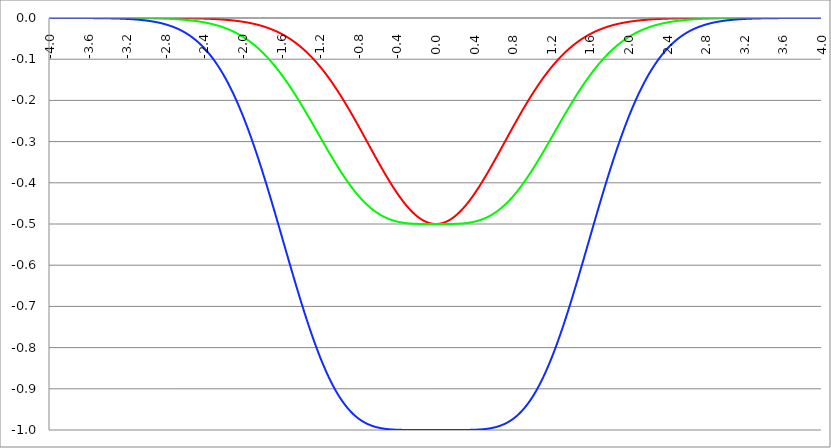
| Category | Series 1 | Series 0 | Series 2 |
|---|---|---|---|
| -4.0 | 0 | 0 | 0 |
| -3.996 | 0 | 0 | 0 |
| -3.992 | 0 | 0 | 0 |
| -3.988 | 0 | 0 | 0 |
| -3.984 | 0 | 0 | 0 |
| -3.98 | 0 | 0 | 0 |
| -3.976 | 0 | 0 | 0 |
| -3.972 | 0 | 0 | 0 |
| -3.968 | 0 | 0 | 0 |
| -3.964 | 0 | 0 | 0 |
| -3.96 | 0 | 0 | 0 |
| -3.956 | 0 | 0 | 0 |
| -3.952 | 0 | 0 | 0 |
| -3.948 | 0 | 0 | 0 |
| -3.944 | 0 | 0 | 0 |
| -3.94 | 0 | 0 | 0 |
| -3.936 | 0 | 0 | 0 |
| -3.932 | 0 | 0 | 0 |
| -3.928 | 0 | 0 | 0 |
| -3.924 | 0 | 0 | 0 |
| -3.92 | 0 | 0 | 0 |
| -3.916 | 0 | 0 | 0 |
| -3.912 | 0 | 0 | 0 |
| -3.908 | 0 | 0 | 0 |
| -3.904 | 0 | 0 | 0 |
| -3.9 | 0 | 0 | 0 |
| -3.896 | 0 | 0 | 0 |
| -3.892 | 0 | 0 | 0 |
| -3.888 | 0 | 0 | 0 |
| -3.884 | 0 | 0 | 0 |
| -3.88 | 0 | 0 | 0 |
| -3.876 | 0 | 0 | 0 |
| -3.872 | 0 | 0 | 0 |
| -3.868 | 0 | 0 | 0 |
| -3.864 | 0 | 0 | 0 |
| -3.86 | 0 | 0 | 0 |
| -3.856 | 0 | 0 | 0 |
| -3.852 | 0 | 0 | 0 |
| -3.848 | 0 | 0 | 0 |
| -3.844 | 0 | 0 | 0 |
| -3.84 | 0 | 0 | 0 |
| -3.836 | 0 | 0 | 0 |
| -3.832 | 0 | 0 | 0 |
| -3.828 | 0 | 0 | 0 |
| -3.824 | 0 | 0 | 0 |
| -3.82 | 0 | 0 | 0 |
| -3.816 | 0 | 0 | 0 |
| -3.812 | 0 | 0 | 0 |
| -3.808 | 0 | 0 | 0 |
| -3.804 | 0 | 0 | 0 |
| -3.8 | 0 | 0 | 0 |
| -3.796 | 0 | 0 | 0 |
| -3.792 | 0 | 0 | 0 |
| -3.788 | 0 | 0 | 0 |
| -3.784 | 0 | 0 | 0 |
| -3.78 | 0 | 0 | 0 |
| -3.776 | 0 | 0 | 0 |
| -3.772 | 0 | 0 | 0 |
| -3.768 | 0 | 0 | 0 |
| -3.764 | 0 | 0 | 0 |
| -3.76 | 0 | 0 | 0 |
| -3.756 | 0 | 0 | 0 |
| -3.752 | 0 | 0 | 0 |
| -3.748 | 0 | 0 | 0 |
| -3.744 | 0 | 0 | 0 |
| -3.74 | 0 | 0 | 0 |
| -3.736 | 0 | 0 | 0 |
| -3.732 | 0 | 0 | 0 |
| -3.728 | 0 | 0 | 0 |
| -3.724 | 0 | 0 | 0 |
| -3.72 | 0 | 0 | 0 |
| -3.716 | 0 | 0 | 0 |
| -3.712 | 0 | 0 | 0 |
| -3.708 | 0 | 0 | 0 |
| -3.704 | 0 | 0 | 0 |
| -3.7 | 0 | 0 | 0 |
| -3.696 | 0 | 0 | 0 |
| -3.692 | 0 | 0 | 0 |
| -3.688 | 0 | 0 | 0 |
| -3.684 | 0 | 0 | 0 |
| -3.68 | 0 | 0 | 0 |
| -3.676 | 0 | 0 | 0 |
| -3.672 | 0 | 0 | 0 |
| -3.668 | 0 | 0 | 0 |
| -3.664 | 0 | 0 | 0 |
| -3.66 | 0 | 0 | 0 |
| -3.656 | 0 | 0 | 0 |
| -3.652 | 0 | 0 | 0 |
| -3.648 | 0 | 0 | 0 |
| -3.644 | 0 | 0 | 0 |
| -3.64 | 0 | 0 | 0 |
| -3.636 | 0 | 0 | 0 |
| -3.632 | 0 | 0 | 0 |
| -3.628 | 0 | 0 | 0 |
| -3.624 | 0 | 0 | 0 |
| -3.62 | 0 | 0 | 0 |
| -3.616 | 0 | 0 | 0 |
| -3.612 | 0 | 0 | 0 |
| -3.608 | 0 | 0 | 0 |
| -3.604 | 0 | 0 | 0 |
| -3.6 | 0 | 0 | 0 |
| -3.596 | 0 | 0 | 0 |
| -3.592 | 0 | 0 | 0 |
| -3.588 | 0 | 0 | 0 |
| -3.584 | 0 | 0 | 0 |
| -3.58 | 0 | 0 | 0 |
| -3.576 | 0 | 0 | 0 |
| -3.572 | 0 | 0 | 0 |
| -3.568 | 0 | 0 | 0 |
| -3.564 | 0 | 0 | 0 |
| -3.56 | 0 | 0 | 0 |
| -3.556 | 0 | 0 | 0 |
| -3.552 | 0 | 0 | 0 |
| -3.548 | 0 | 0 | 0 |
| -3.544 | 0 | 0 | 0 |
| -3.54 | 0 | 0 | 0 |
| -3.536 | 0 | 0 | 0 |
| -3.532 | 0 | 0 | 0 |
| -3.528 | 0 | 0 | 0 |
| -3.524 | 0 | 0 | 0 |
| -3.52 | 0 | 0 | 0 |
| -3.516 | 0 | 0 | 0 |
| -3.512 | 0 | 0 | 0 |
| -3.508 | 0 | 0 | 0 |
| -3.504 | 0 | 0 | 0 |
| -3.5 | 0 | 0 | 0 |
| -3.496 | 0 | 0 | 0 |
| -3.492 | 0 | 0 | 0 |
| -3.488 | 0 | 0 | 0 |
| -3.484 | 0 | 0 | 0 |
| -3.48 | 0 | 0 | 0 |
| -3.476 | 0 | 0 | 0 |
| -3.472 | 0 | 0 | 0 |
| -3.467999999999999 | 0 | 0 | -0.001 |
| -3.463999999999999 | 0 | 0 | -0.001 |
| -3.459999999999999 | 0 | 0 | -0.001 |
| -3.455999999999999 | 0 | 0 | -0.001 |
| -3.451999999999999 | 0 | 0 | -0.001 |
| -3.447999999999999 | 0 | 0 | -0.001 |
| -3.443999999999999 | 0 | 0 | -0.001 |
| -3.439999999999999 | 0 | 0 | -0.001 |
| -3.435999999999999 | 0 | 0 | -0.001 |
| -3.431999999999999 | 0 | 0 | -0.001 |
| -3.427999999999999 | 0 | 0 | -0.001 |
| -3.423999999999999 | 0 | 0 | -0.001 |
| -3.419999999999999 | 0 | 0 | -0.001 |
| -3.415999999999999 | 0 | 0 | -0.001 |
| -3.411999999999999 | 0 | 0 | -0.001 |
| -3.407999999999999 | 0 | 0 | -0.001 |
| -3.403999999999999 | 0 | 0 | -0.001 |
| -3.399999999999999 | 0 | 0 | -0.001 |
| -3.395999999999999 | 0 | 0 | -0.001 |
| -3.391999999999999 | 0 | 0 | -0.001 |
| -3.387999999999999 | 0 | 0 | -0.001 |
| -3.383999999999999 | 0 | 0 | -0.001 |
| -3.379999999999999 | 0 | 0 | -0.001 |
| -3.375999999999999 | 0 | 0 | -0.001 |
| -3.371999999999999 | 0 | 0 | -0.001 |
| -3.367999999999999 | 0 | 0 | -0.001 |
| -3.363999999999999 | 0 | 0 | -0.001 |
| -3.359999999999999 | 0 | 0 | -0.001 |
| -3.355999999999999 | 0 | 0 | -0.001 |
| -3.351999999999999 | 0 | 0 | -0.001 |
| -3.347999999999999 | 0 | 0 | -0.001 |
| -3.343999999999999 | 0 | 0 | -0.001 |
| -3.339999999999999 | 0 | 0 | -0.001 |
| -3.335999999999999 | 0 | 0 | -0.001 |
| -3.331999999999999 | 0 | 0 | -0.001 |
| -3.327999999999999 | 0 | 0 | -0.001 |
| -3.323999999999999 | 0 | 0 | -0.001 |
| -3.319999999999999 | 0 | 0 | -0.001 |
| -3.315999999999999 | 0 | 0 | -0.001 |
| -3.311999999999999 | 0 | 0 | -0.001 |
| -3.307999999999999 | 0 | 0 | -0.001 |
| -3.303999999999999 | 0 | 0 | -0.001 |
| -3.299999999999999 | 0 | 0 | -0.001 |
| -3.295999999999999 | 0 | 0 | -0.001 |
| -3.291999999999999 | 0 | 0 | -0.001 |
| -3.288 | 0 | 0 | -0.001 |
| -3.284 | 0 | 0 | -0.001 |
| -3.279999999999999 | 0 | 0 | -0.001 |
| -3.275999999999999 | 0 | 0 | -0.002 |
| -3.271999999999999 | 0 | 0 | -0.002 |
| -3.268 | 0 | 0 | -0.002 |
| -3.264 | 0 | 0 | -0.002 |
| -3.259999999999999 | 0 | 0 | -0.002 |
| -3.255999999999999 | 0 | 0 | -0.002 |
| -3.251999999999999 | 0 | 0 | -0.002 |
| -3.248 | 0 | 0 | -0.002 |
| -3.244 | 0 | 0 | -0.002 |
| -3.239999999999999 | 0 | 0 | -0.002 |
| -3.235999999999999 | 0 | 0 | -0.002 |
| -3.231999999999999 | 0 | 0 | -0.002 |
| -3.228 | 0 | 0 | -0.002 |
| -3.224 | 0 | 0 | -0.002 |
| -3.219999999999999 | 0 | 0 | -0.002 |
| -3.215999999999999 | 0 | 0 | -0.002 |
| -3.211999999999999 | 0 | 0 | -0.002 |
| -3.208 | 0 | 0 | -0.002 |
| -3.204 | 0 | 0 | -0.002 |
| -3.199999999999999 | 0 | 0 | -0.002 |
| -3.195999999999999 | 0 | 0 | -0.002 |
| -3.191999999999999 | 0 | 0 | -0.002 |
| -3.188 | 0 | 0 | -0.002 |
| -3.184 | 0 | 0 | -0.002 |
| -3.179999999999999 | 0 | 0 | -0.003 |
| -3.175999999999999 | 0 | 0 | -0.003 |
| -3.171999999999999 | 0 | 0 | -0.003 |
| -3.168 | 0 | 0 | -0.003 |
| -3.164 | 0 | 0 | -0.003 |
| -3.159999999999999 | 0 | 0 | -0.003 |
| -3.155999999999999 | 0 | 0 | -0.003 |
| -3.151999999999999 | 0 | 0 | -0.003 |
| -3.148 | 0 | 0 | -0.003 |
| -3.144 | 0 | 0 | -0.003 |
| -3.139999999999999 | 0 | 0 | -0.003 |
| -3.135999999999999 | 0 | 0 | -0.003 |
| -3.131999999999999 | 0 | 0 | -0.003 |
| -3.128 | 0 | 0 | -0.003 |
| -3.124 | 0 | 0 | -0.003 |
| -3.119999999999999 | 0 | 0 | -0.003 |
| -3.115999999999999 | 0 | 0 | -0.004 |
| -3.111999999999999 | 0 | 0 | -0.004 |
| -3.108 | 0 | 0 | -0.004 |
| -3.104 | 0 | 0 | -0.004 |
| -3.099999999999999 | 0 | 0 | -0.004 |
| -3.095999999999999 | 0 | 0 | -0.004 |
| -3.091999999999999 | 0 | 0 | -0.004 |
| -3.088 | 0 | 0 | -0.004 |
| -3.084 | 0 | 0 | -0.004 |
| -3.079999999999999 | 0 | 0 | -0.004 |
| -3.075999999999999 | 0 | 0 | -0.004 |
| -3.071999999999999 | 0 | 0 | -0.004 |
| -3.068 | 0 | 0 | -0.004 |
| -3.064 | 0 | 0 | -0.005 |
| -3.059999999999999 | 0 | 0 | -0.005 |
| -3.055999999999999 | 0 | 0 | -0.005 |
| -3.051999999999999 | 0 | 0 | -0.005 |
| -3.048 | 0 | 0 | -0.005 |
| -3.044 | 0 | 0 | -0.005 |
| -3.039999999999999 | 0 | 0 | -0.005 |
| -3.035999999999999 | 0 | -0.001 | -0.005 |
| -3.031999999999999 | 0 | -0.001 | -0.005 |
| -3.028 | 0 | -0.001 | -0.005 |
| -3.024 | 0 | -0.001 | -0.006 |
| -3.019999999999999 | 0 | -0.001 | -0.006 |
| -3.015999999999999 | 0 | -0.001 | -0.006 |
| -3.011999999999999 | 0 | -0.001 | -0.006 |
| -3.008 | 0 | -0.001 | -0.006 |
| -3.004 | 0 | -0.001 | -0.006 |
| -2.999999999999999 | 0 | -0.001 | -0.006 |
| -2.995999999999999 | 0 | -0.001 | -0.006 |
| -2.991999999999999 | 0 | -0.001 | -0.006 |
| -2.988 | 0 | -0.001 | -0.007 |
| -2.984 | 0 | -0.001 | -0.007 |
| -2.979999999999999 | 0 | -0.001 | -0.007 |
| -2.975999999999999 | 0 | -0.001 | -0.007 |
| -2.971999999999999 | 0 | -0.001 | -0.007 |
| -2.968 | 0 | -0.001 | -0.007 |
| -2.964 | 0 | -0.001 | -0.007 |
| -2.959999999999999 | 0 | -0.001 | -0.008 |
| -2.955999999999999 | 0 | -0.001 | -0.008 |
| -2.951999999999999 | 0 | -0.001 | -0.008 |
| -2.948 | 0 | -0.001 | -0.008 |
| -2.944 | 0 | -0.001 | -0.008 |
| -2.939999999999999 | 0 | -0.001 | -0.008 |
| -2.935999999999999 | 0 | -0.001 | -0.008 |
| -2.931999999999999 | 0 | -0.001 | -0.009 |
| -2.928 | 0 | -0.001 | -0.009 |
| -2.924 | 0 | -0.001 | -0.009 |
| -2.919999999999999 | 0 | -0.001 | -0.009 |
| -2.915999999999999 | 0 | -0.001 | -0.009 |
| -2.911999999999999 | 0 | -0.001 | -0.009 |
| -2.908 | 0 | -0.001 | -0.01 |
| -2.904 | 0 | -0.001 | -0.01 |
| -2.899999999999999 | 0 | -0.001 | -0.01 |
| -2.895999999999999 | 0 | -0.001 | -0.01 |
| -2.891999999999999 | 0 | -0.001 | -0.01 |
| -2.887999999999999 | 0 | -0.001 | -0.011 |
| -2.883999999999999 | 0 | -0.001 | -0.011 |
| -2.879999999999999 | 0 | -0.001 | -0.011 |
| -2.875999999999999 | 0 | -0.001 | -0.011 |
| -2.871999999999999 | 0 | -0.001 | -0.011 |
| -2.867999999999999 | 0 | -0.001 | -0.012 |
| -2.863999999999999 | 0 | -0.001 | -0.012 |
| -2.859999999999999 | 0 | -0.001 | -0.012 |
| -2.855999999999999 | 0 | -0.001 | -0.012 |
| -2.851999999999999 | 0 | -0.001 | -0.012 |
| -2.847999999999999 | 0 | -0.001 | -0.013 |
| -2.843999999999999 | 0 | -0.001 | -0.013 |
| -2.839999999999999 | 0 | -0.001 | -0.013 |
| -2.835999999999999 | 0 | -0.001 | -0.013 |
| -2.831999999999999 | 0 | -0.001 | -0.014 |
| -2.827999999999999 | 0 | -0.002 | -0.014 |
| -2.823999999999999 | 0 | -0.002 | -0.014 |
| -2.819999999999999 | 0 | -0.002 | -0.014 |
| -2.815999999999999 | 0 | -0.002 | -0.015 |
| -2.811999999999999 | 0 | -0.002 | -0.015 |
| -2.807999999999999 | 0 | -0.002 | -0.015 |
| -2.803999999999999 | 0 | -0.002 | -0.015 |
| -2.799999999999999 | 0 | -0.002 | -0.016 |
| -2.795999999999999 | 0 | -0.002 | -0.016 |
| -2.791999999999999 | 0 | -0.002 | -0.016 |
| -2.787999999999999 | 0 | -0.002 | -0.016 |
| -2.783999999999999 | 0 | -0.002 | -0.017 |
| -2.779999999999999 | 0 | -0.002 | -0.017 |
| -2.775999999999999 | 0 | -0.002 | -0.017 |
| -2.771999999999999 | 0 | -0.002 | -0.018 |
| -2.767999999999999 | 0 | -0.002 | -0.018 |
| -2.763999999999999 | 0 | -0.002 | -0.018 |
| -2.759999999999999 | 0 | -0.002 | -0.019 |
| -2.755999999999999 | 0 | -0.002 | -0.019 |
| -2.751999999999999 | 0 | -0.002 | -0.019 |
| -2.747999999999999 | 0 | -0.002 | -0.019 |
| -2.743999999999999 | 0 | -0.002 | -0.02 |
| -2.739999999999999 | 0 | -0.002 | -0.02 |
| -2.735999999999999 | 0 | -0.002 | -0.02 |
| -2.731999999999999 | 0 | -0.002 | -0.021 |
| -2.727999999999999 | 0 | -0.002 | -0.021 |
| -2.723999999999999 | 0 | -0.003 | -0.022 |
| -2.719999999999999 | 0 | -0.003 | -0.022 |
| -2.715999999999999 | 0 | -0.003 | -0.022 |
| -2.711999999999999 | 0 | -0.003 | -0.023 |
| -2.707999999999999 | 0 | -0.003 | -0.023 |
| -2.703999999999999 | 0 | -0.003 | -0.023 |
| -2.699999999999999 | 0 | -0.003 | -0.024 |
| -2.695999999999999 | 0 | -0.003 | -0.024 |
| -2.691999999999999 | 0 | -0.003 | -0.025 |
| -2.687999999999999 | 0 | -0.003 | -0.025 |
| -2.683999999999999 | 0 | -0.003 | -0.025 |
| -2.679999999999999 | 0 | -0.003 | -0.026 |
| -2.675999999999999 | 0 | -0.003 | -0.026 |
| -2.671999999999999 | 0 | -0.003 | -0.027 |
| -2.667999999999999 | 0 | -0.003 | -0.027 |
| -2.663999999999999 | 0 | -0.003 | -0.028 |
| -2.659999999999999 | 0 | -0.003 | -0.028 |
| -2.655999999999999 | 0 | -0.003 | -0.028 |
| -2.651999999999999 | 0 | -0.004 | -0.029 |
| -2.647999999999999 | 0 | -0.004 | -0.029 |
| -2.643999999999999 | 0 | -0.004 | -0.03 |
| -2.639999999999999 | 0 | -0.004 | -0.03 |
| -2.635999999999999 | 0 | -0.004 | -0.031 |
| -2.631999999999999 | 0 | -0.004 | -0.031 |
| -2.627999999999999 | -0.001 | -0.004 | -0.032 |
| -2.623999999999999 | -0.001 | -0.004 | -0.032 |
| -2.619999999999999 | -0.001 | -0.004 | -0.033 |
| -2.615999999999999 | -0.001 | -0.004 | -0.033 |
| -2.611999999999999 | -0.001 | -0.004 | -0.034 |
| -2.607999999999999 | -0.001 | -0.004 | -0.034 |
| -2.603999999999999 | -0.001 | -0.004 | -0.035 |
| -2.599999999999999 | -0.001 | -0.004 | -0.035 |
| -2.595999999999999 | -0.001 | -0.005 | -0.036 |
| -2.591999999999999 | -0.001 | -0.005 | -0.037 |
| -2.587999999999999 | -0.001 | -0.005 | -0.037 |
| -2.583999999999999 | -0.001 | -0.005 | -0.038 |
| -2.579999999999999 | -0.001 | -0.005 | -0.038 |
| -2.575999999999999 | -0.001 | -0.005 | -0.039 |
| -2.571999999999999 | -0.001 | -0.005 | -0.04 |
| -2.567999999999999 | -0.001 | -0.005 | -0.04 |
| -2.563999999999999 | -0.001 | -0.005 | -0.041 |
| -2.559999999999999 | -0.001 | -0.005 | -0.041 |
| -2.555999999999999 | -0.001 | -0.005 | -0.042 |
| -2.551999999999999 | -0.001 | -0.006 | -0.043 |
| -2.547999999999999 | -0.001 | -0.006 | -0.043 |
| -2.543999999999999 | -0.001 | -0.006 | -0.044 |
| -2.539999999999999 | -0.001 | -0.006 | -0.045 |
| -2.535999999999999 | -0.001 | -0.006 | -0.045 |
| -2.531999999999999 | -0.001 | -0.006 | -0.046 |
| -2.527999999999999 | -0.001 | -0.006 | -0.047 |
| -2.523999999999999 | -0.001 | -0.006 | -0.047 |
| -2.519999999999999 | -0.001 | -0.006 | -0.048 |
| -2.515999999999999 | -0.001 | -0.007 | -0.049 |
| -2.511999999999999 | -0.001 | -0.007 | -0.049 |
| -2.507999999999999 | -0.001 | -0.007 | -0.05 |
| -2.503999999999999 | -0.001 | -0.007 | -0.051 |
| -2.499999999999999 | -0.001 | -0.007 | -0.052 |
| -2.495999999999999 | -0.001 | -0.007 | -0.052 |
| -2.491999999999999 | -0.001 | -0.007 | -0.053 |
| -2.487999999999999 | -0.001 | -0.007 | -0.054 |
| -2.483999999999999 | -0.001 | -0.007 | -0.055 |
| -2.479999999999999 | -0.001 | -0.008 | -0.056 |
| -2.475999999999999 | -0.001 | -0.008 | -0.056 |
| -2.471999999999999 | -0.001 | -0.008 | -0.057 |
| -2.467999999999999 | -0.001 | -0.008 | -0.058 |
| -2.463999999999999 | -0.001 | -0.008 | -0.059 |
| -2.459999999999999 | -0.001 | -0.008 | -0.06 |
| -2.455999999999999 | -0.001 | -0.008 | -0.061 |
| -2.451999999999999 | -0.001 | -0.009 | -0.061 |
| -2.447999999999999 | -0.001 | -0.009 | -0.062 |
| -2.443999999999999 | -0.001 | -0.009 | -0.063 |
| -2.439999999999999 | -0.001 | -0.009 | -0.064 |
| -2.435999999999999 | -0.001 | -0.009 | -0.065 |
| -2.431999999999999 | -0.001 | -0.009 | -0.066 |
| -2.427999999999999 | -0.001 | -0.009 | -0.067 |
| -2.423999999999999 | -0.001 | -0.01 | -0.068 |
| -2.419999999999999 | -0.001 | -0.01 | -0.069 |
| -2.415999999999999 | -0.001 | -0.01 | -0.07 |
| -2.411999999999999 | -0.001 | -0.01 | -0.071 |
| -2.407999999999999 | -0.002 | -0.01 | -0.072 |
| -2.403999999999999 | -0.002 | -0.01 | -0.073 |
| -2.399999999999999 | -0.002 | -0.011 | -0.074 |
| -2.395999999999999 | -0.002 | -0.011 | -0.075 |
| -2.391999999999999 | -0.002 | -0.011 | -0.076 |
| -2.387999999999999 | -0.002 | -0.011 | -0.077 |
| -2.383999999999999 | -0.002 | -0.011 | -0.078 |
| -2.379999999999999 | -0.002 | -0.012 | -0.079 |
| -2.375999999999999 | -0.002 | -0.012 | -0.08 |
| -2.371999999999999 | -0.002 | -0.012 | -0.081 |
| -2.367999999999998 | -0.002 | -0.012 | -0.082 |
| -2.363999999999998 | -0.002 | -0.012 | -0.083 |
| -2.359999999999998 | -0.002 | -0.013 | -0.084 |
| -2.355999999999998 | -0.002 | -0.013 | -0.085 |
| -2.351999999999998 | -0.002 | -0.013 | -0.086 |
| -2.347999999999998 | -0.002 | -0.013 | -0.088 |
| -2.343999999999998 | -0.002 | -0.013 | -0.089 |
| -2.339999999999998 | -0.002 | -0.014 | -0.09 |
| -2.335999999999998 | -0.002 | -0.014 | -0.091 |
| -2.331999999999998 | -0.002 | -0.014 | -0.092 |
| -2.327999999999998 | -0.002 | -0.014 | -0.093 |
| -2.323999999999998 | -0.002 | -0.014 | -0.095 |
| -2.319999999999998 | -0.002 | -0.015 | -0.096 |
| -2.315999999999998 | -0.002 | -0.015 | -0.097 |
| -2.311999999999998 | -0.002 | -0.015 | -0.098 |
| -2.307999999999998 | -0.002 | -0.015 | -0.1 |
| -2.303999999999998 | -0.002 | -0.016 | -0.101 |
| -2.299999999999998 | -0.003 | -0.016 | -0.102 |
| -2.295999999999998 | -0.003 | -0.016 | -0.104 |
| -2.291999999999998 | -0.003 | -0.016 | -0.105 |
| -2.287999999999998 | -0.003 | -0.017 | -0.106 |
| -2.283999999999998 | -0.003 | -0.017 | -0.108 |
| -2.279999999999998 | -0.003 | -0.017 | -0.109 |
| -2.275999999999998 | -0.003 | -0.017 | -0.11 |
| -2.271999999999998 | -0.003 | -0.018 | -0.112 |
| -2.267999999999998 | -0.003 | -0.018 | -0.113 |
| -2.263999999999998 | -0.003 | -0.018 | -0.114 |
| -2.259999999999998 | -0.003 | -0.018 | -0.116 |
| -2.255999999999998 | -0.003 | -0.019 | -0.117 |
| -2.251999999999998 | -0.003 | -0.019 | -0.119 |
| -2.247999999999998 | -0.003 | -0.019 | -0.12 |
| -2.243999999999998 | -0.003 | -0.02 | -0.122 |
| -2.239999999999998 | -0.003 | -0.02 | -0.123 |
| -2.235999999999998 | -0.003 | -0.02 | -0.125 |
| -2.231999999999998 | -0.003 | -0.021 | -0.126 |
| -2.227999999999998 | -0.003 | -0.021 | -0.128 |
| -2.223999999999998 | -0.004 | -0.021 | -0.129 |
| -2.219999999999998 | -0.004 | -0.021 | -0.131 |
| -2.215999999999998 | -0.004 | -0.022 | -0.132 |
| -2.211999999999998 | -0.004 | -0.022 | -0.134 |
| -2.207999999999998 | -0.004 | -0.022 | -0.136 |
| -2.203999999999998 | -0.004 | -0.023 | -0.137 |
| -2.199999999999998 | -0.004 | -0.023 | -0.139 |
| -2.195999999999998 | -0.004 | -0.023 | -0.14 |
| -2.191999999999998 | -0.004 | -0.024 | -0.142 |
| -2.187999999999998 | -0.004 | -0.024 | -0.144 |
| -2.183999999999998 | -0.004 | -0.024 | -0.145 |
| -2.179999999999998 | -0.004 | -0.025 | -0.147 |
| -2.175999999999998 | -0.004 | -0.025 | -0.149 |
| -2.171999999999998 | -0.004 | -0.026 | -0.151 |
| -2.167999999999998 | -0.005 | -0.026 | -0.152 |
| -2.163999999999998 | -0.005 | -0.026 | -0.154 |
| -2.159999999999998 | -0.005 | -0.027 | -0.156 |
| -2.155999999999998 | -0.005 | -0.027 | -0.158 |
| -2.151999999999998 | -0.005 | -0.027 | -0.159 |
| -2.147999999999998 | -0.005 | -0.028 | -0.161 |
| -2.143999999999998 | -0.005 | -0.028 | -0.163 |
| -2.139999999999998 | -0.005 | -0.029 | -0.165 |
| -2.135999999999998 | -0.005 | -0.029 | -0.167 |
| -2.131999999999998 | -0.005 | -0.029 | -0.169 |
| -2.127999999999998 | -0.005 | -0.03 | -0.17 |
| -2.123999999999998 | -0.005 | -0.03 | -0.172 |
| -2.119999999999998 | -0.006 | -0.031 | -0.174 |
| -2.115999999999998 | -0.006 | -0.031 | -0.176 |
| -2.111999999999998 | -0.006 | -0.032 | -0.178 |
| -2.107999999999998 | -0.006 | -0.032 | -0.18 |
| -2.103999999999998 | -0.006 | -0.032 | -0.182 |
| -2.099999999999998 | -0.006 | -0.033 | -0.184 |
| -2.095999999999998 | -0.006 | -0.033 | -0.186 |
| -2.091999999999998 | -0.006 | -0.034 | -0.188 |
| -2.087999999999998 | -0.006 | -0.034 | -0.19 |
| -2.083999999999998 | -0.006 | -0.035 | -0.192 |
| -2.079999999999998 | -0.007 | -0.035 | -0.194 |
| -2.075999999999998 | -0.007 | -0.036 | -0.196 |
| -2.071999999999998 | -0.007 | -0.036 | -0.198 |
| -2.067999999999998 | -0.007 | -0.037 | -0.2 |
| -2.063999999999998 | -0.007 | -0.037 | -0.202 |
| -2.059999999999998 | -0.007 | -0.038 | -0.205 |
| -2.055999999999998 | -0.007 | -0.038 | -0.207 |
| -2.051999999999998 | -0.007 | -0.039 | -0.209 |
| -2.047999999999998 | -0.008 | -0.039 | -0.211 |
| -2.043999999999998 | -0.008 | -0.04 | -0.213 |
| -2.039999999999998 | -0.008 | -0.04 | -0.215 |
| -2.035999999999998 | -0.008 | -0.041 | -0.218 |
| -2.031999999999998 | -0.008 | -0.041 | -0.22 |
| -2.027999999999998 | -0.008 | -0.042 | -0.222 |
| -2.023999999999998 | -0.008 | -0.042 | -0.224 |
| -2.019999999999998 | -0.008 | -0.043 | -0.227 |
| -2.015999999999998 | -0.009 | -0.043 | -0.229 |
| -2.011999999999998 | -0.009 | -0.044 | -0.231 |
| -2.007999999999998 | -0.009 | -0.045 | -0.233 |
| -2.003999999999998 | -0.009 | -0.045 | -0.236 |
| -1.999999999999998 | -0.009 | -0.046 | -0.238 |
| -1.995999999999998 | -0.009 | -0.046 | -0.24 |
| -1.991999999999998 | -0.009 | -0.047 | -0.243 |
| -1.987999999999998 | -0.01 | -0.048 | -0.245 |
| -1.983999999999998 | -0.01 | -0.048 | -0.248 |
| -1.979999999999998 | -0.01 | -0.049 | -0.25 |
| -1.975999999999998 | -0.01 | -0.049 | -0.252 |
| -1.971999999999998 | -0.01 | -0.05 | -0.255 |
| -1.967999999999998 | -0.01 | -0.051 | -0.257 |
| -1.963999999999998 | -0.011 | -0.051 | -0.26 |
| -1.959999999999998 | -0.011 | -0.052 | -0.262 |
| -1.955999999999998 | -0.011 | -0.053 | -0.265 |
| -1.951999999999998 | -0.011 | -0.053 | -0.267 |
| -1.947999999999998 | -0.011 | -0.054 | -0.27 |
| -1.943999999999998 | -0.011 | -0.055 | -0.272 |
| -1.939999999999998 | -0.012 | -0.055 | -0.275 |
| -1.935999999999998 | -0.012 | -0.056 | -0.277 |
| -1.931999999999998 | -0.012 | -0.057 | -0.28 |
| -1.927999999999998 | -0.012 | -0.057 | -0.283 |
| -1.923999999999998 | -0.012 | -0.058 | -0.285 |
| -1.919999999999998 | -0.013 | -0.059 | -0.288 |
| -1.915999999999998 | -0.013 | -0.059 | -0.29 |
| -1.911999999999998 | -0.013 | -0.06 | -0.293 |
| -1.907999999999998 | -0.013 | -0.061 | -0.296 |
| -1.903999999999998 | -0.013 | -0.062 | -0.298 |
| -1.899999999999998 | -0.014 | -0.062 | -0.301 |
| -1.895999999999998 | -0.014 | -0.063 | -0.304 |
| -1.891999999999998 | -0.014 | -0.064 | -0.306 |
| -1.887999999999998 | -0.014 | -0.065 | -0.309 |
| -1.883999999999998 | -0.014 | -0.065 | -0.312 |
| -1.879999999999998 | -0.015 | -0.066 | -0.315 |
| -1.875999999999998 | -0.015 | -0.067 | -0.317 |
| -1.871999999999998 | -0.015 | -0.068 | -0.32 |
| -1.867999999999998 | -0.015 | -0.069 | -0.323 |
| -1.863999999999998 | -0.015 | -0.069 | -0.326 |
| -1.859999999999998 | -0.016 | -0.07 | -0.328 |
| -1.855999999999998 | -0.016 | -0.071 | -0.331 |
| -1.851999999999998 | -0.016 | -0.072 | -0.334 |
| -1.847999999999998 | -0.016 | -0.073 | -0.337 |
| -1.843999999999998 | -0.017 | -0.073 | -0.34 |
| -1.839999999999998 | -0.017 | -0.074 | -0.343 |
| -1.835999999999998 | -0.017 | -0.075 | -0.345 |
| -1.831999999999998 | -0.017 | -0.076 | -0.348 |
| -1.827999999999998 | -0.018 | -0.077 | -0.351 |
| -1.823999999999998 | -0.018 | -0.078 | -0.354 |
| -1.819999999999998 | -0.018 | -0.079 | -0.357 |
| -1.815999999999998 | -0.018 | -0.079 | -0.36 |
| -1.811999999999998 | -0.019 | -0.08 | -0.363 |
| -1.807999999999998 | -0.019 | -0.081 | -0.366 |
| -1.803999999999998 | -0.019 | -0.082 | -0.369 |
| -1.799999999999998 | -0.02 | -0.083 | -0.372 |
| -1.795999999999998 | -0.02 | -0.084 | -0.375 |
| -1.791999999999998 | -0.02 | -0.085 | -0.378 |
| -1.787999999999998 | -0.02 | -0.086 | -0.381 |
| -1.783999999999998 | -0.021 | -0.087 | -0.384 |
| -1.779999999999998 | -0.021 | -0.088 | -0.387 |
| -1.775999999999998 | -0.021 | -0.089 | -0.39 |
| -1.771999999999998 | -0.022 | -0.09 | -0.393 |
| -1.767999999999998 | -0.022 | -0.091 | -0.396 |
| -1.763999999999998 | -0.022 | -0.092 | -0.399 |
| -1.759999999999998 | -0.023 | -0.093 | -0.402 |
| -1.755999999999998 | -0.023 | -0.094 | -0.405 |
| -1.751999999999998 | -0.023 | -0.095 | -0.408 |
| -1.747999999999998 | -0.024 | -0.096 | -0.411 |
| -1.743999999999998 | -0.024 | -0.097 | -0.414 |
| -1.739999999999998 | -0.024 | -0.098 | -0.417 |
| -1.735999999999998 | -0.025 | -0.099 | -0.42 |
| -1.731999999999998 | -0.025 | -0.1 | -0.423 |
| -1.727999999999998 | -0.025 | -0.101 | -0.426 |
| -1.723999999999998 | -0.026 | -0.102 | -0.429 |
| -1.719999999999998 | -0.026 | -0.103 | -0.433 |
| -1.715999999999998 | -0.026 | -0.104 | -0.436 |
| -1.711999999999998 | -0.027 | -0.105 | -0.439 |
| -1.707999999999998 | -0.027 | -0.106 | -0.442 |
| -1.703999999999998 | -0.027 | -0.107 | -0.445 |
| -1.699999999999998 | -0.028 | -0.108 | -0.448 |
| -1.695999999999998 | -0.028 | -0.109 | -0.451 |
| -1.691999999999998 | -0.029 | -0.11 | -0.455 |
| -1.687999999999998 | -0.029 | -0.111 | -0.458 |
| -1.683999999999998 | -0.029 | -0.113 | -0.461 |
| -1.679999999999998 | -0.03 | -0.114 | -0.464 |
| -1.675999999999998 | -0.03 | -0.115 | -0.467 |
| -1.671999999999998 | -0.031 | -0.116 | -0.471 |
| -1.667999999999998 | -0.031 | -0.117 | -0.474 |
| -1.663999999999998 | -0.031 | -0.118 | -0.477 |
| -1.659999999999998 | -0.032 | -0.119 | -0.48 |
| -1.655999999999998 | -0.032 | -0.121 | -0.483 |
| -1.651999999999998 | -0.033 | -0.122 | -0.487 |
| -1.647999999999998 | -0.033 | -0.123 | -0.49 |
| -1.643999999999998 | -0.034 | -0.124 | -0.493 |
| -1.639999999999998 | -0.034 | -0.125 | -0.496 |
| -1.635999999999998 | -0.034 | -0.126 | -0.499 |
| -1.631999999999998 | -0.035 | -0.128 | -0.503 |
| -1.627999999999998 | -0.035 | -0.129 | -0.506 |
| -1.623999999999998 | -0.036 | -0.13 | -0.509 |
| -1.619999999999998 | -0.036 | -0.131 | -0.512 |
| -1.615999999999998 | -0.037 | -0.133 | -0.516 |
| -1.611999999999998 | -0.037 | -0.134 | -0.519 |
| -1.607999999999998 | -0.038 | -0.135 | -0.522 |
| -1.603999999999998 | -0.038 | -0.136 | -0.525 |
| -1.599999999999998 | -0.039 | -0.138 | -0.529 |
| -1.595999999999998 | -0.039 | -0.139 | -0.532 |
| -1.591999999999998 | -0.04 | -0.14 | -0.535 |
| -1.587999999999998 | -0.04 | -0.141 | -0.538 |
| -1.583999999999998 | -0.041 | -0.143 | -0.541 |
| -1.579999999999998 | -0.041 | -0.144 | -0.545 |
| -1.575999999999998 | -0.042 | -0.145 | -0.548 |
| -1.571999999999998 | -0.042 | -0.147 | -0.551 |
| -1.567999999999998 | -0.043 | -0.148 | -0.554 |
| -1.563999999999998 | -0.043 | -0.149 | -0.558 |
| -1.559999999999998 | -0.044 | -0.151 | -0.561 |
| -1.555999999999998 | -0.044 | -0.152 | -0.564 |
| -1.551999999999998 | -0.045 | -0.153 | -0.567 |
| -1.547999999999998 | -0.046 | -0.155 | -0.571 |
| -1.543999999999998 | -0.046 | -0.156 | -0.574 |
| -1.539999999999998 | -0.047 | -0.157 | -0.577 |
| -1.535999999999998 | -0.047 | -0.159 | -0.58 |
| -1.531999999999998 | -0.048 | -0.16 | -0.584 |
| -1.527999999999998 | -0.048 | -0.161 | -0.587 |
| -1.523999999999998 | -0.049 | -0.163 | -0.59 |
| -1.519999999999998 | -0.05 | -0.164 | -0.593 |
| -1.515999999999998 | -0.05 | -0.166 | -0.597 |
| -1.511999999999998 | -0.051 | -0.167 | -0.6 |
| -1.507999999999998 | -0.051 | -0.168 | -0.603 |
| -1.503999999999998 | -0.052 | -0.17 | -0.606 |
| -1.499999999999998 | -0.053 | -0.171 | -0.609 |
| -1.495999999999998 | -0.053 | -0.173 | -0.613 |
| -1.491999999999998 | -0.054 | -0.174 | -0.616 |
| -1.487999999999998 | -0.055 | -0.176 | -0.619 |
| -1.483999999999998 | -0.055 | -0.177 | -0.622 |
| -1.479999999999998 | -0.056 | -0.178 | -0.625 |
| -1.475999999999998 | -0.057 | -0.18 | -0.628 |
| -1.471999999999998 | -0.057 | -0.181 | -0.632 |
| -1.467999999999998 | -0.058 | -0.183 | -0.635 |
| -1.463999999999998 | -0.059 | -0.184 | -0.638 |
| -1.459999999999998 | -0.059 | -0.186 | -0.641 |
| -1.455999999999998 | -0.06 | -0.187 | -0.644 |
| -1.451999999999998 | -0.061 | -0.189 | -0.647 |
| -1.447999999999998 | -0.061 | -0.19 | -0.651 |
| -1.443999999999998 | -0.062 | -0.192 | -0.654 |
| -1.439999999999998 | -0.063 | -0.193 | -0.657 |
| -1.435999999999998 | -0.064 | -0.195 | -0.66 |
| -1.431999999999998 | -0.064 | -0.196 | -0.663 |
| -1.427999999999998 | -0.065 | -0.198 | -0.666 |
| -1.423999999999998 | -0.066 | -0.199 | -0.669 |
| -1.419999999999998 | -0.067 | -0.201 | -0.672 |
| -1.415999999999998 | -0.067 | -0.202 | -0.675 |
| -1.411999999999998 | -0.068 | -0.204 | -0.678 |
| -1.407999999999998 | -0.069 | -0.205 | -0.681 |
| -1.403999999999998 | -0.07 | -0.207 | -0.684 |
| -1.399999999999998 | -0.07 | -0.208 | -0.688 |
| -1.395999999999998 | -0.071 | -0.21 | -0.691 |
| -1.391999999999998 | -0.072 | -0.212 | -0.694 |
| -1.387999999999998 | -0.073 | -0.213 | -0.697 |
| -1.383999999999998 | -0.074 | -0.215 | -0.7 |
| -1.379999999999998 | -0.074 | -0.216 | -0.703 |
| -1.375999999999998 | -0.075 | -0.218 | -0.706 |
| -1.371999999999998 | -0.076 | -0.219 | -0.708 |
| -1.367999999999998 | -0.077 | -0.221 | -0.711 |
| -1.363999999999998 | -0.078 | -0.223 | -0.714 |
| -1.359999999999998 | -0.079 | -0.224 | -0.717 |
| -1.355999999999998 | -0.08 | -0.226 | -0.72 |
| -1.351999999999998 | -0.08 | -0.227 | -0.723 |
| -1.347999999999998 | -0.081 | -0.229 | -0.726 |
| -1.343999999999998 | -0.082 | -0.23 | -0.729 |
| -1.339999999999998 | -0.083 | -0.232 | -0.732 |
| -1.335999999999998 | -0.084 | -0.234 | -0.735 |
| -1.331999999999998 | -0.085 | -0.235 | -0.738 |
| -1.327999999999998 | -0.086 | -0.237 | -0.74 |
| -1.323999999999998 | -0.087 | -0.238 | -0.743 |
| -1.319999999999998 | -0.088 | -0.24 | -0.746 |
| -1.315999999999998 | -0.088 | -0.242 | -0.749 |
| -1.311999999999998 | -0.089 | -0.243 | -0.752 |
| -1.307999999999998 | -0.09 | -0.245 | -0.754 |
| -1.303999999999998 | -0.091 | -0.247 | -0.757 |
| -1.299999999999998 | -0.092 | -0.248 | -0.76 |
| -1.295999999999998 | -0.093 | -0.25 | -0.763 |
| -1.291999999999998 | -0.094 | -0.251 | -0.765 |
| -1.287999999999998 | -0.095 | -0.253 | -0.768 |
| -1.283999999999998 | -0.096 | -0.255 | -0.771 |
| -1.279999999999998 | -0.097 | -0.256 | -0.773 |
| -1.275999999999998 | -0.098 | -0.258 | -0.776 |
| -1.271999999999998 | -0.099 | -0.26 | -0.779 |
| -1.267999999999998 | -0.1 | -0.261 | -0.781 |
| -1.263999999999998 | -0.101 | -0.263 | -0.784 |
| -1.259999999999998 | -0.102 | -0.264 | -0.787 |
| -1.255999999999998 | -0.103 | -0.266 | -0.789 |
| -1.251999999999998 | -0.104 | -0.268 | -0.792 |
| -1.247999999999998 | -0.105 | -0.269 | -0.794 |
| -1.243999999999998 | -0.106 | -0.271 | -0.797 |
| -1.239999999999998 | -0.107 | -0.273 | -0.799 |
| -1.235999999999998 | -0.109 | -0.274 | -0.802 |
| -1.231999999999998 | -0.11 | -0.276 | -0.804 |
| -1.227999999999998 | -0.111 | -0.278 | -0.807 |
| -1.223999999999998 | -0.112 | -0.279 | -0.809 |
| -1.219999999999998 | -0.113 | -0.281 | -0.812 |
| -1.215999999999998 | -0.114 | -0.282 | -0.814 |
| -1.211999999999998 | -0.115 | -0.284 | -0.817 |
| -1.207999999999998 | -0.116 | -0.286 | -0.819 |
| -1.203999999999998 | -0.117 | -0.287 | -0.821 |
| -1.199999999999997 | -0.118 | -0.289 | -0.824 |
| -1.195999999999997 | -0.12 | -0.291 | -0.826 |
| -1.191999999999997 | -0.121 | -0.292 | -0.828 |
| -1.187999999999997 | -0.122 | -0.294 | -0.831 |
| -1.183999999999997 | -0.123 | -0.296 | -0.833 |
| -1.179999999999997 | -0.124 | -0.297 | -0.835 |
| -1.175999999999997 | -0.125 | -0.299 | -0.838 |
| -1.171999999999997 | -0.127 | -0.3 | -0.84 |
| -1.167999999999997 | -0.128 | -0.302 | -0.842 |
| -1.163999999999997 | -0.129 | -0.304 | -0.844 |
| -1.159999999999997 | -0.13 | -0.305 | -0.846 |
| -1.155999999999997 | -0.131 | -0.307 | -0.849 |
| -1.151999999999997 | -0.133 | -0.309 | -0.851 |
| -1.147999999999997 | -0.134 | -0.31 | -0.853 |
| -1.143999999999997 | -0.135 | -0.312 | -0.855 |
| -1.139999999999997 | -0.136 | -0.313 | -0.857 |
| -1.135999999999997 | -0.138 | -0.315 | -0.859 |
| -1.131999999999997 | -0.139 | -0.317 | -0.861 |
| -1.127999999999997 | -0.14 | -0.318 | -0.863 |
| -1.123999999999997 | -0.141 | -0.32 | -0.865 |
| -1.119999999999997 | -0.143 | -0.322 | -0.867 |
| -1.115999999999997 | -0.144 | -0.323 | -0.869 |
| -1.111999999999997 | -0.145 | -0.325 | -0.871 |
| -1.107999999999997 | -0.146 | -0.326 | -0.873 |
| -1.103999999999997 | -0.148 | -0.328 | -0.875 |
| -1.099999999999997 | -0.149 | -0.33 | -0.877 |
| -1.095999999999997 | -0.15 | -0.331 | -0.879 |
| -1.091999999999997 | -0.152 | -0.333 | -0.881 |
| -1.087999999999997 | -0.153 | -0.334 | -0.883 |
| -1.083999999999997 | -0.154 | -0.336 | -0.885 |
| -1.079999999999997 | -0.156 | -0.337 | -0.887 |
| -1.075999999999997 | -0.157 | -0.339 | -0.889 |
| -1.071999999999997 | -0.158 | -0.341 | -0.89 |
| -1.067999999999997 | -0.16 | -0.342 | -0.892 |
| -1.063999999999997 | -0.161 | -0.344 | -0.894 |
| -1.059999999999997 | -0.163 | -0.345 | -0.896 |
| -1.055999999999997 | -0.164 | -0.347 | -0.897 |
| -1.051999999999997 | -0.165 | -0.348 | -0.899 |
| -1.047999999999997 | -0.167 | -0.35 | -0.901 |
| -1.043999999999997 | -0.168 | -0.351 | -0.902 |
| -1.039999999999997 | -0.17 | -0.353 | -0.904 |
| -1.035999999999997 | -0.171 | -0.354 | -0.906 |
| -1.031999999999997 | -0.172 | -0.356 | -0.907 |
| -1.027999999999997 | -0.174 | -0.357 | -0.909 |
| -1.023999999999997 | -0.175 | -0.359 | -0.911 |
| -1.019999999999997 | -0.177 | -0.36 | -0.912 |
| -1.015999999999997 | -0.178 | -0.362 | -0.914 |
| -1.011999999999997 | -0.18 | -0.363 | -0.915 |
| -1.007999999999997 | -0.181 | -0.365 | -0.917 |
| -1.003999999999997 | -0.182 | -0.366 | -0.918 |
| -0.999999999999997 | -0.184 | -0.368 | -0.92 |
| -0.995999999999997 | -0.185 | -0.369 | -0.921 |
| -0.991999999999997 | -0.187 | -0.371 | -0.923 |
| -0.987999999999997 | -0.188 | -0.372 | -0.924 |
| -0.983999999999997 | -0.19 | -0.374 | -0.925 |
| -0.979999999999997 | -0.191 | -0.375 | -0.927 |
| -0.975999999999997 | -0.193 | -0.377 | -0.928 |
| -0.971999999999997 | -0.194 | -0.378 | -0.93 |
| -0.967999999999997 | -0.196 | -0.379 | -0.931 |
| -0.963999999999997 | -0.197 | -0.381 | -0.932 |
| -0.959999999999997 | -0.199 | -0.382 | -0.934 |
| -0.955999999999997 | -0.2 | -0.384 | -0.935 |
| -0.951999999999997 | -0.202 | -0.385 | -0.936 |
| -0.947999999999997 | -0.204 | -0.386 | -0.937 |
| -0.943999999999997 | -0.205 | -0.388 | -0.939 |
| -0.939999999999997 | -0.207 | -0.389 | -0.94 |
| -0.935999999999997 | -0.208 | -0.391 | -0.941 |
| -0.931999999999997 | -0.21 | -0.392 | -0.942 |
| -0.927999999999997 | -0.211 | -0.393 | -0.943 |
| -0.923999999999997 | -0.213 | -0.395 | -0.945 |
| -0.919999999999997 | -0.214 | -0.396 | -0.946 |
| -0.915999999999997 | -0.216 | -0.397 | -0.947 |
| -0.911999999999997 | -0.218 | -0.399 | -0.948 |
| -0.907999999999997 | -0.219 | -0.4 | -0.949 |
| -0.903999999999997 | -0.221 | -0.401 | -0.95 |
| -0.899999999999997 | -0.222 | -0.403 | -0.951 |
| -0.895999999999997 | -0.224 | -0.404 | -0.952 |
| -0.891999999999997 | -0.226 | -0.405 | -0.953 |
| -0.887999999999997 | -0.227 | -0.406 | -0.954 |
| -0.883999999999997 | -0.229 | -0.408 | -0.955 |
| -0.879999999999997 | -0.23 | -0.409 | -0.956 |
| -0.875999999999997 | -0.232 | -0.41 | -0.957 |
| -0.871999999999997 | -0.234 | -0.411 | -0.958 |
| -0.867999999999997 | -0.235 | -0.413 | -0.959 |
| -0.863999999999997 | -0.237 | -0.414 | -0.96 |
| -0.859999999999997 | -0.239 | -0.415 | -0.961 |
| -0.855999999999997 | -0.24 | -0.416 | -0.962 |
| -0.851999999999997 | -0.242 | -0.418 | -0.963 |
| -0.847999999999997 | -0.244 | -0.419 | -0.963 |
| -0.843999999999997 | -0.245 | -0.42 | -0.964 |
| -0.839999999999997 | -0.247 | -0.421 | -0.965 |
| -0.835999999999997 | -0.249 | -0.422 | -0.966 |
| -0.831999999999997 | -0.25 | -0.423 | -0.967 |
| -0.827999999999997 | -0.252 | -0.425 | -0.968 |
| -0.823999999999997 | -0.254 | -0.426 | -0.968 |
| -0.819999999999997 | -0.255 | -0.427 | -0.969 |
| -0.815999999999997 | -0.257 | -0.428 | -0.97 |
| -0.811999999999997 | -0.259 | -0.429 | -0.971 |
| -0.807999999999997 | -0.26 | -0.43 | -0.971 |
| -0.803999999999997 | -0.262 | -0.431 | -0.972 |
| -0.799999999999997 | -0.264 | -0.432 | -0.973 |
| -0.795999999999997 | -0.265 | -0.433 | -0.973 |
| -0.791999999999997 | -0.267 | -0.435 | -0.974 |
| -0.787999999999997 | -0.269 | -0.436 | -0.975 |
| -0.783999999999997 | -0.27 | -0.437 | -0.975 |
| -0.779999999999997 | -0.272 | -0.438 | -0.976 |
| -0.775999999999997 | -0.274 | -0.439 | -0.977 |
| -0.771999999999997 | -0.276 | -0.44 | -0.977 |
| -0.767999999999997 | -0.277 | -0.441 | -0.978 |
| -0.763999999999997 | -0.279 | -0.442 | -0.978 |
| -0.759999999999997 | -0.281 | -0.443 | -0.979 |
| -0.755999999999997 | -0.282 | -0.444 | -0.98 |
| -0.751999999999997 | -0.284 | -0.445 | -0.98 |
| -0.747999999999997 | -0.286 | -0.446 | -0.981 |
| -0.743999999999997 | -0.287 | -0.447 | -0.981 |
| -0.739999999999997 | -0.289 | -0.448 | -0.982 |
| -0.735999999999997 | -0.291 | -0.448 | -0.982 |
| -0.731999999999997 | -0.293 | -0.449 | -0.983 |
| -0.727999999999997 | -0.294 | -0.45 | -0.983 |
| -0.723999999999997 | -0.296 | -0.451 | -0.984 |
| -0.719999999999997 | -0.298 | -0.452 | -0.984 |
| -0.715999999999997 | -0.299 | -0.453 | -0.985 |
| -0.711999999999997 | -0.301 | -0.454 | -0.985 |
| -0.707999999999997 | -0.303 | -0.455 | -0.986 |
| -0.703999999999997 | -0.305 | -0.456 | -0.986 |
| -0.699999999999997 | -0.306 | -0.456 | -0.986 |
| -0.695999999999997 | -0.308 | -0.457 | -0.987 |
| -0.691999999999997 | -0.31 | -0.458 | -0.987 |
| -0.687999999999997 | -0.311 | -0.459 | -0.988 |
| -0.683999999999997 | -0.313 | -0.46 | -0.988 |
| -0.679999999999997 | -0.315 | -0.46 | -0.988 |
| -0.675999999999997 | -0.317 | -0.461 | -0.989 |
| -0.671999999999997 | -0.318 | -0.462 | -0.989 |
| -0.667999999999997 | -0.32 | -0.463 | -0.989 |
| -0.663999999999997 | -0.322 | -0.464 | -0.99 |
| -0.659999999999997 | -0.323 | -0.464 | -0.99 |
| -0.655999999999997 | -0.325 | -0.465 | -0.99 |
| -0.651999999999997 | -0.327 | -0.466 | -0.991 |
| -0.647999999999997 | -0.329 | -0.467 | -0.991 |
| -0.643999999999997 | -0.33 | -0.467 | -0.991 |
| -0.639999999999997 | -0.332 | -0.468 | -0.992 |
| -0.635999999999997 | -0.334 | -0.469 | -0.992 |
| -0.631999999999997 | -0.335 | -0.469 | -0.992 |
| -0.627999999999997 | -0.337 | -0.47 | -0.992 |
| -0.623999999999997 | -0.339 | -0.471 | -0.993 |
| -0.619999999999997 | -0.34 | -0.471 | -0.993 |
| -0.615999999999997 | -0.342 | -0.472 | -0.993 |
| -0.611999999999997 | -0.344 | -0.473 | -0.993 |
| -0.607999999999997 | -0.345 | -0.473 | -0.994 |
| -0.603999999999997 | -0.347 | -0.474 | -0.994 |
| -0.599999999999997 | -0.349 | -0.474 | -0.994 |
| -0.595999999999997 | -0.351 | -0.475 | -0.994 |
| -0.591999999999997 | -0.352 | -0.476 | -0.994 |
| -0.587999999999997 | -0.354 | -0.476 | -0.995 |
| -0.583999999999997 | -0.356 | -0.477 | -0.995 |
| -0.579999999999997 | -0.357 | -0.477 | -0.995 |
| -0.575999999999997 | -0.359 | -0.478 | -0.995 |
| -0.571999999999997 | -0.36 | -0.478 | -0.995 |
| -0.567999999999997 | -0.362 | -0.479 | -0.996 |
| -0.563999999999997 | -0.364 | -0.479 | -0.996 |
| -0.559999999999997 | -0.365 | -0.48 | -0.996 |
| -0.555999999999997 | -0.367 | -0.481 | -0.996 |
| -0.551999999999997 | -0.369 | -0.481 | -0.996 |
| -0.547999999999997 | -0.37 | -0.481 | -0.996 |
| -0.543999999999997 | -0.372 | -0.482 | -0.997 |
| -0.539999999999997 | -0.374 | -0.482 | -0.997 |
| -0.535999999999997 | -0.375 | -0.483 | -0.997 |
| -0.531999999999997 | -0.377 | -0.483 | -0.997 |
| -0.527999999999997 | -0.378 | -0.484 | -0.997 |
| -0.523999999999997 | -0.38 | -0.484 | -0.997 |
| -0.519999999999997 | -0.382 | -0.485 | -0.997 |
| -0.515999999999997 | -0.383 | -0.485 | -0.997 |
| -0.511999999999997 | -0.385 | -0.486 | -0.998 |
| -0.507999999999997 | -0.386 | -0.486 | -0.998 |
| -0.503999999999997 | -0.388 | -0.486 | -0.998 |
| -0.499999999999997 | -0.389 | -0.487 | -0.998 |
| -0.495999999999997 | -0.391 | -0.487 | -0.998 |
| -0.491999999999997 | -0.393 | -0.488 | -0.998 |
| -0.487999999999997 | -0.394 | -0.488 | -0.998 |
| -0.483999999999997 | -0.396 | -0.488 | -0.998 |
| -0.479999999999997 | -0.397 | -0.489 | -0.998 |
| -0.475999999999997 | -0.399 | -0.489 | -0.998 |
| -0.471999999999997 | -0.4 | -0.489 | -0.998 |
| -0.467999999999997 | -0.402 | -0.49 | -0.999 |
| -0.463999999999997 | -0.403 | -0.49 | -0.999 |
| -0.459999999999997 | -0.405 | -0.49 | -0.999 |
| -0.455999999999997 | -0.406 | -0.491 | -0.999 |
| -0.451999999999997 | -0.408 | -0.491 | -0.999 |
| -0.447999999999997 | -0.409 | -0.491 | -0.999 |
| -0.443999999999997 | -0.411 | -0.491 | -0.999 |
| -0.439999999999997 | -0.412 | -0.492 | -0.999 |
| -0.435999999999997 | -0.413 | -0.492 | -0.999 |
| -0.431999999999997 | -0.415 | -0.492 | -0.999 |
| -0.427999999999997 | -0.416 | -0.493 | -0.999 |
| -0.423999999999997 | -0.418 | -0.493 | -0.999 |
| -0.419999999999997 | -0.419 | -0.493 | -0.999 |
| -0.415999999999997 | -0.421 | -0.493 | -0.999 |
| -0.411999999999997 | -0.422 | -0.494 | -0.999 |
| -0.407999999999997 | -0.423 | -0.494 | -0.999 |
| -0.403999999999997 | -0.425 | -0.494 | -0.999 |
| -0.399999999999997 | -0.426 | -0.494 | -0.999 |
| -0.395999999999997 | -0.427 | -0.494 | -0.999 |
| -0.391999999999997 | -0.429 | -0.495 | -0.999 |
| -0.387999999999997 | -0.43 | -0.495 | -0.999 |
| -0.383999999999997 | -0.431 | -0.495 | -1 |
| -0.379999999999997 | -0.433 | -0.495 | -1 |
| -0.375999999999997 | -0.434 | -0.495 | -1 |
| -0.371999999999997 | -0.435 | -0.496 | -1 |
| -0.367999999999997 | -0.437 | -0.496 | -1 |
| -0.363999999999997 | -0.438 | -0.496 | -1 |
| -0.359999999999997 | -0.439 | -0.496 | -1 |
| -0.355999999999997 | -0.44 | -0.496 | -1 |
| -0.351999999999997 | -0.442 | -0.496 | -1 |
| -0.347999999999997 | -0.443 | -0.497 | -1 |
| -0.343999999999997 | -0.444 | -0.497 | -1 |
| -0.339999999999997 | -0.445 | -0.497 | -1 |
| -0.335999999999997 | -0.447 | -0.497 | -1 |
| -0.331999999999997 | -0.448 | -0.497 | -1 |
| -0.327999999999997 | -0.449 | -0.497 | -1 |
| -0.323999999999997 | -0.45 | -0.497 | -1 |
| -0.319999999999997 | -0.451 | -0.498 | -1 |
| -0.315999999999997 | -0.452 | -0.498 | -1 |
| -0.311999999999997 | -0.454 | -0.498 | -1 |
| -0.307999999999997 | -0.455 | -0.498 | -1 |
| -0.303999999999997 | -0.456 | -0.498 | -1 |
| -0.299999999999997 | -0.457 | -0.498 | -1 |
| -0.295999999999997 | -0.458 | -0.498 | -1 |
| -0.291999999999997 | -0.459 | -0.498 | -1 |
| -0.287999999999997 | -0.46 | -0.498 | -1 |
| -0.283999999999997 | -0.461 | -0.498 | -1 |
| -0.279999999999997 | -0.462 | -0.499 | -1 |
| -0.275999999999997 | -0.463 | -0.499 | -1 |
| -0.271999999999997 | -0.464 | -0.499 | -1 |
| -0.267999999999997 | -0.465 | -0.499 | -1 |
| -0.263999999999997 | -0.466 | -0.499 | -1 |
| -0.259999999999997 | -0.467 | -0.499 | -1 |
| -0.255999999999997 | -0.468 | -0.499 | -1 |
| -0.251999999999997 | -0.469 | -0.499 | -1 |
| -0.247999999999997 | -0.47 | -0.499 | -1 |
| -0.243999999999997 | -0.471 | -0.499 | -1 |
| -0.239999999999997 | -0.472 | -0.499 | -1 |
| -0.235999999999997 | -0.473 | -0.499 | -1 |
| -0.231999999999997 | -0.474 | -0.499 | -1 |
| -0.227999999999997 | -0.475 | -0.499 | -1 |
| -0.223999999999997 | -0.476 | -0.499 | -1 |
| -0.219999999999997 | -0.476 | -0.499 | -1 |
| -0.215999999999997 | -0.477 | -0.499 | -1 |
| -0.211999999999997 | -0.478 | -0.5 | -1 |
| -0.207999999999997 | -0.479 | -0.5 | -1 |
| -0.203999999999997 | -0.48 | -0.5 | -1 |
| -0.199999999999997 | -0.48 | -0.5 | -1 |
| -0.195999999999997 | -0.481 | -0.5 | -1 |
| -0.191999999999997 | -0.482 | -0.5 | -1 |
| -0.187999999999997 | -0.483 | -0.5 | -1 |
| -0.183999999999997 | -0.483 | -0.5 | -1 |
| -0.179999999999997 | -0.484 | -0.5 | -1 |
| -0.175999999999997 | -0.485 | -0.5 | -1 |
| -0.171999999999997 | -0.485 | -0.5 | -1 |
| -0.167999999999997 | -0.486 | -0.5 | -1 |
| -0.163999999999997 | -0.487 | -0.5 | -1 |
| -0.159999999999997 | -0.487 | -0.5 | -1 |
| -0.155999999999997 | -0.488 | -0.5 | -1 |
| -0.151999999999997 | -0.489 | -0.5 | -1 |
| -0.147999999999997 | -0.489 | -0.5 | -1 |
| -0.143999999999997 | -0.49 | -0.5 | -1 |
| -0.139999999999997 | -0.49 | -0.5 | -1 |
| -0.135999999999997 | -0.491 | -0.5 | -1 |
| -0.131999999999997 | -0.491 | -0.5 | -1 |
| -0.127999999999997 | -0.492 | -0.5 | -1 |
| -0.123999999999997 | -0.492 | -0.5 | -1 |
| -0.119999999999997 | -0.493 | -0.5 | -1 |
| -0.115999999999997 | -0.493 | -0.5 | -1 |
| -0.111999999999997 | -0.494 | -0.5 | -1 |
| -0.107999999999997 | -0.494 | -0.5 | -1 |
| -0.103999999999997 | -0.495 | -0.5 | -1 |
| -0.0999999999999965 | -0.495 | -0.5 | -1 |
| -0.0959999999999965 | -0.495 | -0.5 | -1 |
| -0.0919999999999965 | -0.496 | -0.5 | -1 |
| -0.0879999999999965 | -0.496 | -0.5 | -1 |
| -0.0839999999999965 | -0.496 | -0.5 | -1 |
| -0.0799999999999965 | -0.497 | -0.5 | -1 |
| -0.0759999999999965 | -0.497 | -0.5 | -1 |
| -0.0719999999999965 | -0.497 | -0.5 | -1 |
| -0.0679999999999965 | -0.498 | -0.5 | -1 |
| -0.0639999999999965 | -0.498 | -0.5 | -1 |
| -0.0599999999999965 | -0.498 | -0.5 | -1 |
| -0.0559999999999965 | -0.498 | -0.5 | -1 |
| -0.0519999999999965 | -0.499 | -0.5 | -1 |
| -0.0479999999999965 | -0.499 | -0.5 | -1 |
| -0.0439999999999965 | -0.499 | -0.5 | -1 |
| -0.0399999999999965 | -0.499 | -0.5 | -1 |
| -0.0359999999999965 | -0.499 | -0.5 | -1 |
| -0.0319999999999965 | -0.499 | -0.5 | -1 |
| -0.0279999999999965 | -0.5 | -0.5 | -1 |
| -0.0239999999999965 | -0.5 | -0.5 | -1 |
| -0.0199999999999965 | -0.5 | -0.5 | -1 |
| -0.0159999999999965 | -0.5 | -0.5 | -1 |
| -0.0119999999999965 | -0.5 | -0.5 | -1 |
| -0.00799999999999647 | -0.5 | -0.5 | -1 |
| -0.00399999999999647 | -0.5 | -0.5 | -1 |
| 3.52495810318487e-15 | -0.5 | -0.5 | -1 |
| 0.00400000000000352 | -0.5 | -0.5 | -1 |
| 0.00800000000000352 | -0.5 | -0.5 | -1 |
| 0.0120000000000035 | -0.5 | -0.5 | -1 |
| 0.0160000000000035 | -0.5 | -0.5 | -1 |
| 0.0200000000000035 | -0.5 | -0.5 | -1 |
| 0.0240000000000035 | -0.5 | -0.5 | -1 |
| 0.0280000000000035 | -0.5 | -0.5 | -1 |
| 0.0320000000000035 | -0.499 | -0.5 | -1 |
| 0.0360000000000035 | -0.499 | -0.5 | -1 |
| 0.0400000000000035 | -0.499 | -0.5 | -1 |
| 0.0440000000000035 | -0.499 | -0.5 | -1 |
| 0.0480000000000035 | -0.499 | -0.5 | -1 |
| 0.0520000000000035 | -0.499 | -0.5 | -1 |
| 0.0560000000000035 | -0.498 | -0.5 | -1 |
| 0.0600000000000035 | -0.498 | -0.5 | -1 |
| 0.0640000000000035 | -0.498 | -0.5 | -1 |
| 0.0680000000000035 | -0.498 | -0.5 | -1 |
| 0.0720000000000036 | -0.497 | -0.5 | -1 |
| 0.0760000000000036 | -0.497 | -0.5 | -1 |
| 0.0800000000000036 | -0.497 | -0.5 | -1 |
| 0.0840000000000036 | -0.496 | -0.5 | -1 |
| 0.0880000000000036 | -0.496 | -0.5 | -1 |
| 0.0920000000000036 | -0.496 | -0.5 | -1 |
| 0.0960000000000036 | -0.495 | -0.5 | -1 |
| 0.100000000000004 | -0.495 | -0.5 | -1 |
| 0.104000000000004 | -0.495 | -0.5 | -1 |
| 0.108000000000004 | -0.494 | -0.5 | -1 |
| 0.112000000000004 | -0.494 | -0.5 | -1 |
| 0.116000000000004 | -0.493 | -0.5 | -1 |
| 0.120000000000004 | -0.493 | -0.5 | -1 |
| 0.124000000000004 | -0.492 | -0.5 | -1 |
| 0.128000000000004 | -0.492 | -0.5 | -1 |
| 0.132000000000004 | -0.491 | -0.5 | -1 |
| 0.136000000000004 | -0.491 | -0.5 | -1 |
| 0.140000000000004 | -0.49 | -0.5 | -1 |
| 0.144000000000004 | -0.49 | -0.5 | -1 |
| 0.148000000000004 | -0.489 | -0.5 | -1 |
| 0.152000000000004 | -0.489 | -0.5 | -1 |
| 0.156000000000004 | -0.488 | -0.5 | -1 |
| 0.160000000000004 | -0.487 | -0.5 | -1 |
| 0.164000000000004 | -0.487 | -0.5 | -1 |
| 0.168000000000004 | -0.486 | -0.5 | -1 |
| 0.172000000000004 | -0.485 | -0.5 | -1 |
| 0.176000000000004 | -0.485 | -0.5 | -1 |
| 0.180000000000004 | -0.484 | -0.5 | -1 |
| 0.184000000000004 | -0.483 | -0.5 | -1 |
| 0.188000000000004 | -0.483 | -0.5 | -1 |
| 0.192000000000004 | -0.482 | -0.5 | -1 |
| 0.196000000000004 | -0.481 | -0.5 | -1 |
| 0.200000000000004 | -0.48 | -0.5 | -1 |
| 0.204000000000004 | -0.48 | -0.5 | -1 |
| 0.208000000000004 | -0.479 | -0.5 | -1 |
| 0.212000000000004 | -0.478 | -0.5 | -1 |
| 0.216000000000004 | -0.477 | -0.499 | -1 |
| 0.220000000000004 | -0.476 | -0.499 | -1 |
| 0.224000000000004 | -0.476 | -0.499 | -1 |
| 0.228000000000004 | -0.475 | -0.499 | -1 |
| 0.232000000000004 | -0.474 | -0.499 | -1 |
| 0.236000000000004 | -0.473 | -0.499 | -1 |
| 0.240000000000004 | -0.472 | -0.499 | -1 |
| 0.244000000000004 | -0.471 | -0.499 | -1 |
| 0.248000000000004 | -0.47 | -0.499 | -1 |
| 0.252000000000004 | -0.469 | -0.499 | -1 |
| 0.256000000000004 | -0.468 | -0.499 | -1 |
| 0.260000000000004 | -0.467 | -0.499 | -1 |
| 0.264000000000004 | -0.466 | -0.499 | -1 |
| 0.268000000000004 | -0.465 | -0.499 | -1 |
| 0.272000000000004 | -0.464 | -0.499 | -1 |
| 0.276000000000004 | -0.463 | -0.499 | -1 |
| 0.280000000000004 | -0.462 | -0.499 | -1 |
| 0.284000000000004 | -0.461 | -0.498 | -1 |
| 0.288000000000004 | -0.46 | -0.498 | -1 |
| 0.292000000000004 | -0.459 | -0.498 | -1 |
| 0.296000000000004 | -0.458 | -0.498 | -1 |
| 0.300000000000004 | -0.457 | -0.498 | -1 |
| 0.304000000000004 | -0.456 | -0.498 | -1 |
| 0.308000000000004 | -0.455 | -0.498 | -1 |
| 0.312000000000004 | -0.454 | -0.498 | -1 |
| 0.316000000000004 | -0.452 | -0.498 | -1 |
| 0.320000000000004 | -0.451 | -0.498 | -1 |
| 0.324000000000004 | -0.45 | -0.497 | -1 |
| 0.328000000000004 | -0.449 | -0.497 | -1 |
| 0.332000000000004 | -0.448 | -0.497 | -1 |
| 0.336000000000004 | -0.447 | -0.497 | -1 |
| 0.340000000000004 | -0.445 | -0.497 | -1 |
| 0.344000000000004 | -0.444 | -0.497 | -1 |
| 0.348000000000004 | -0.443 | -0.497 | -1 |
| 0.352000000000004 | -0.442 | -0.496 | -1 |
| 0.356000000000004 | -0.44 | -0.496 | -1 |
| 0.360000000000004 | -0.439 | -0.496 | -1 |
| 0.364000000000004 | -0.438 | -0.496 | -1 |
| 0.368000000000004 | -0.437 | -0.496 | -1 |
| 0.372000000000004 | -0.435 | -0.496 | -1 |
| 0.376000000000004 | -0.434 | -0.495 | -1 |
| 0.380000000000004 | -0.433 | -0.495 | -1 |
| 0.384000000000004 | -0.431 | -0.495 | -1 |
| 0.388000000000004 | -0.43 | -0.495 | -0.999 |
| 0.392000000000004 | -0.429 | -0.495 | -0.999 |
| 0.396000000000004 | -0.427 | -0.494 | -0.999 |
| 0.400000000000004 | -0.426 | -0.494 | -0.999 |
| 0.404000000000004 | -0.425 | -0.494 | -0.999 |
| 0.408000000000004 | -0.423 | -0.494 | -0.999 |
| 0.412000000000004 | -0.422 | -0.494 | -0.999 |
| 0.416000000000004 | -0.421 | -0.493 | -0.999 |
| 0.420000000000004 | -0.419 | -0.493 | -0.999 |
| 0.424000000000004 | -0.418 | -0.493 | -0.999 |
| 0.428000000000004 | -0.416 | -0.493 | -0.999 |
| 0.432000000000004 | -0.415 | -0.492 | -0.999 |
| 0.436000000000004 | -0.413 | -0.492 | -0.999 |
| 0.440000000000004 | -0.412 | -0.492 | -0.999 |
| 0.444000000000004 | -0.411 | -0.491 | -0.999 |
| 0.448000000000004 | -0.409 | -0.491 | -0.999 |
| 0.452000000000004 | -0.408 | -0.491 | -0.999 |
| 0.456000000000004 | -0.406 | -0.491 | -0.999 |
| 0.460000000000004 | -0.405 | -0.49 | -0.999 |
| 0.464000000000004 | -0.403 | -0.49 | -0.999 |
| 0.468000000000004 | -0.402 | -0.49 | -0.999 |
| 0.472000000000004 | -0.4 | -0.489 | -0.998 |
| 0.476000000000004 | -0.399 | -0.489 | -0.998 |
| 0.480000000000004 | -0.397 | -0.489 | -0.998 |
| 0.484000000000004 | -0.396 | -0.488 | -0.998 |
| 0.488000000000004 | -0.394 | -0.488 | -0.998 |
| 0.492000000000004 | -0.393 | -0.488 | -0.998 |
| 0.496000000000004 | -0.391 | -0.487 | -0.998 |
| 0.500000000000004 | -0.389 | -0.487 | -0.998 |
| 0.504000000000004 | -0.388 | -0.486 | -0.998 |
| 0.508000000000004 | -0.386 | -0.486 | -0.998 |
| 0.512000000000004 | -0.385 | -0.486 | -0.998 |
| 0.516000000000004 | -0.383 | -0.485 | -0.997 |
| 0.520000000000004 | -0.382 | -0.485 | -0.997 |
| 0.524000000000004 | -0.38 | -0.484 | -0.997 |
| 0.528000000000004 | -0.378 | -0.484 | -0.997 |
| 0.532000000000004 | -0.377 | -0.483 | -0.997 |
| 0.536000000000004 | -0.375 | -0.483 | -0.997 |
| 0.540000000000004 | -0.374 | -0.482 | -0.997 |
| 0.544000000000004 | -0.372 | -0.482 | -0.997 |
| 0.548000000000004 | -0.37 | -0.481 | -0.996 |
| 0.552000000000004 | -0.369 | -0.481 | -0.996 |
| 0.556000000000004 | -0.367 | -0.481 | -0.996 |
| 0.560000000000004 | -0.365 | -0.48 | -0.996 |
| 0.564000000000004 | -0.364 | -0.479 | -0.996 |
| 0.568000000000004 | -0.362 | -0.479 | -0.996 |
| 0.572000000000004 | -0.36 | -0.478 | -0.995 |
| 0.576000000000004 | -0.359 | -0.478 | -0.995 |
| 0.580000000000004 | -0.357 | -0.477 | -0.995 |
| 0.584000000000004 | -0.356 | -0.477 | -0.995 |
| 0.588000000000004 | -0.354 | -0.476 | -0.995 |
| 0.592000000000004 | -0.352 | -0.476 | -0.994 |
| 0.596000000000004 | -0.351 | -0.475 | -0.994 |
| 0.600000000000004 | -0.349 | -0.474 | -0.994 |
| 0.604000000000004 | -0.347 | -0.474 | -0.994 |
| 0.608000000000004 | -0.345 | -0.473 | -0.994 |
| 0.612000000000004 | -0.344 | -0.473 | -0.993 |
| 0.616000000000004 | -0.342 | -0.472 | -0.993 |
| 0.620000000000004 | -0.34 | -0.471 | -0.993 |
| 0.624000000000004 | -0.339 | -0.471 | -0.993 |
| 0.628000000000004 | -0.337 | -0.47 | -0.992 |
| 0.632000000000004 | -0.335 | -0.469 | -0.992 |
| 0.636000000000004 | -0.334 | -0.469 | -0.992 |
| 0.640000000000004 | -0.332 | -0.468 | -0.992 |
| 0.644000000000004 | -0.33 | -0.467 | -0.991 |
| 0.648000000000004 | -0.329 | -0.467 | -0.991 |
| 0.652000000000004 | -0.327 | -0.466 | -0.991 |
| 0.656000000000004 | -0.325 | -0.465 | -0.99 |
| 0.660000000000004 | -0.323 | -0.464 | -0.99 |
| 0.664000000000004 | -0.322 | -0.464 | -0.99 |
| 0.668000000000004 | -0.32 | -0.463 | -0.989 |
| 0.672000000000004 | -0.318 | -0.462 | -0.989 |
| 0.676000000000004 | -0.317 | -0.461 | -0.989 |
| 0.680000000000004 | -0.315 | -0.46 | -0.988 |
| 0.684000000000004 | -0.313 | -0.46 | -0.988 |
| 0.688000000000004 | -0.311 | -0.459 | -0.988 |
| 0.692000000000004 | -0.31 | -0.458 | -0.987 |
| 0.696000000000004 | -0.308 | -0.457 | -0.987 |
| 0.700000000000004 | -0.306 | -0.456 | -0.986 |
| 0.704000000000004 | -0.305 | -0.456 | -0.986 |
| 0.708000000000004 | -0.303 | -0.455 | -0.986 |
| 0.712000000000004 | -0.301 | -0.454 | -0.985 |
| 0.716000000000004 | -0.299 | -0.453 | -0.985 |
| 0.720000000000004 | -0.298 | -0.452 | -0.984 |
| 0.724000000000004 | -0.296 | -0.451 | -0.984 |
| 0.728000000000004 | -0.294 | -0.45 | -0.983 |
| 0.732000000000004 | -0.293 | -0.449 | -0.983 |
| 0.736000000000004 | -0.291 | -0.448 | -0.982 |
| 0.740000000000004 | -0.289 | -0.448 | -0.982 |
| 0.744000000000004 | -0.287 | -0.447 | -0.981 |
| 0.748000000000004 | -0.286 | -0.446 | -0.981 |
| 0.752000000000004 | -0.284 | -0.445 | -0.98 |
| 0.756000000000004 | -0.282 | -0.444 | -0.98 |
| 0.760000000000004 | -0.281 | -0.443 | -0.979 |
| 0.764000000000004 | -0.279 | -0.442 | -0.978 |
| 0.768000000000004 | -0.277 | -0.441 | -0.978 |
| 0.772000000000004 | -0.276 | -0.44 | -0.977 |
| 0.776000000000004 | -0.274 | -0.439 | -0.977 |
| 0.780000000000004 | -0.272 | -0.438 | -0.976 |
| 0.784000000000004 | -0.27 | -0.437 | -0.975 |
| 0.788000000000004 | -0.269 | -0.436 | -0.975 |
| 0.792000000000004 | -0.267 | -0.435 | -0.974 |
| 0.796000000000004 | -0.265 | -0.433 | -0.973 |
| 0.800000000000004 | -0.264 | -0.432 | -0.973 |
| 0.804000000000004 | -0.262 | -0.431 | -0.972 |
| 0.808000000000004 | -0.26 | -0.43 | -0.971 |
| 0.812000000000004 | -0.259 | -0.429 | -0.971 |
| 0.816000000000004 | -0.257 | -0.428 | -0.97 |
| 0.820000000000004 | -0.255 | -0.427 | -0.969 |
| 0.824000000000004 | -0.254 | -0.426 | -0.968 |
| 0.828000000000004 | -0.252 | -0.425 | -0.968 |
| 0.832000000000004 | -0.25 | -0.423 | -0.967 |
| 0.836000000000004 | -0.249 | -0.422 | -0.966 |
| 0.840000000000004 | -0.247 | -0.421 | -0.965 |
| 0.844000000000004 | -0.245 | -0.42 | -0.964 |
| 0.848000000000004 | -0.244 | -0.419 | -0.963 |
| 0.852000000000004 | -0.242 | -0.418 | -0.963 |
| 0.856000000000004 | -0.24 | -0.416 | -0.962 |
| 0.860000000000004 | -0.239 | -0.415 | -0.961 |
| 0.864000000000004 | -0.237 | -0.414 | -0.96 |
| 0.868000000000004 | -0.235 | -0.413 | -0.959 |
| 0.872000000000004 | -0.234 | -0.411 | -0.958 |
| 0.876000000000004 | -0.232 | -0.41 | -0.957 |
| 0.880000000000004 | -0.23 | -0.409 | -0.956 |
| 0.884000000000004 | -0.229 | -0.408 | -0.955 |
| 0.888000000000004 | -0.227 | -0.406 | -0.954 |
| 0.892000000000004 | -0.226 | -0.405 | -0.953 |
| 0.896000000000004 | -0.224 | -0.404 | -0.952 |
| 0.900000000000004 | -0.222 | -0.403 | -0.951 |
| 0.904000000000004 | -0.221 | -0.401 | -0.95 |
| 0.908000000000004 | -0.219 | -0.4 | -0.949 |
| 0.912000000000004 | -0.218 | -0.399 | -0.948 |
| 0.916000000000004 | -0.216 | -0.397 | -0.947 |
| 0.920000000000004 | -0.214 | -0.396 | -0.946 |
| 0.924000000000004 | -0.213 | -0.395 | -0.945 |
| 0.928000000000004 | -0.211 | -0.393 | -0.943 |
| 0.932000000000004 | -0.21 | -0.392 | -0.942 |
| 0.936000000000004 | -0.208 | -0.391 | -0.941 |
| 0.940000000000004 | -0.207 | -0.389 | -0.94 |
| 0.944000000000004 | -0.205 | -0.388 | -0.939 |
| 0.948000000000004 | -0.204 | -0.386 | -0.937 |
| 0.952000000000004 | -0.202 | -0.385 | -0.936 |
| 0.956000000000004 | -0.2 | -0.384 | -0.935 |
| 0.960000000000004 | -0.199 | -0.382 | -0.934 |
| 0.964000000000004 | -0.197 | -0.381 | -0.932 |
| 0.968000000000004 | -0.196 | -0.379 | -0.931 |
| 0.972000000000004 | -0.194 | -0.378 | -0.93 |
| 0.976000000000004 | -0.193 | -0.377 | -0.928 |
| 0.980000000000004 | -0.191 | -0.375 | -0.927 |
| 0.984000000000004 | -0.19 | -0.374 | -0.925 |
| 0.988000000000004 | -0.188 | -0.372 | -0.924 |
| 0.992000000000004 | -0.187 | -0.371 | -0.923 |
| 0.996000000000004 | -0.185 | -0.369 | -0.921 |
| 1.000000000000004 | -0.184 | -0.368 | -0.92 |
| 1.004000000000004 | -0.182 | -0.366 | -0.918 |
| 1.008000000000004 | -0.181 | -0.365 | -0.917 |
| 1.012000000000004 | -0.18 | -0.363 | -0.915 |
| 1.016000000000004 | -0.178 | -0.362 | -0.914 |
| 1.020000000000004 | -0.177 | -0.36 | -0.912 |
| 1.024000000000004 | -0.175 | -0.359 | -0.911 |
| 1.028000000000004 | -0.174 | -0.357 | -0.909 |
| 1.032000000000004 | -0.172 | -0.356 | -0.907 |
| 1.036000000000004 | -0.171 | -0.354 | -0.906 |
| 1.040000000000004 | -0.17 | -0.353 | -0.904 |
| 1.044000000000004 | -0.168 | -0.351 | -0.902 |
| 1.048000000000004 | -0.167 | -0.35 | -0.901 |
| 1.052000000000004 | -0.165 | -0.348 | -0.899 |
| 1.056000000000004 | -0.164 | -0.347 | -0.897 |
| 1.060000000000004 | -0.163 | -0.345 | -0.896 |
| 1.064000000000004 | -0.161 | -0.344 | -0.894 |
| 1.068000000000004 | -0.16 | -0.342 | -0.892 |
| 1.072000000000004 | -0.158 | -0.341 | -0.89 |
| 1.076000000000004 | -0.157 | -0.339 | -0.889 |
| 1.080000000000004 | -0.156 | -0.337 | -0.887 |
| 1.084000000000004 | -0.154 | -0.336 | -0.885 |
| 1.088000000000004 | -0.153 | -0.334 | -0.883 |
| 1.092000000000004 | -0.152 | -0.333 | -0.881 |
| 1.096000000000004 | -0.15 | -0.331 | -0.879 |
| 1.100000000000004 | -0.149 | -0.33 | -0.877 |
| 1.104000000000004 | -0.148 | -0.328 | -0.875 |
| 1.108000000000004 | -0.146 | -0.326 | -0.873 |
| 1.112000000000004 | -0.145 | -0.325 | -0.871 |
| 1.116000000000004 | -0.144 | -0.323 | -0.869 |
| 1.120000000000004 | -0.143 | -0.322 | -0.867 |
| 1.124000000000004 | -0.141 | -0.32 | -0.865 |
| 1.128000000000004 | -0.14 | -0.318 | -0.863 |
| 1.132000000000004 | -0.139 | -0.317 | -0.861 |
| 1.136000000000004 | -0.138 | -0.315 | -0.859 |
| 1.140000000000004 | -0.136 | -0.313 | -0.857 |
| 1.144000000000004 | -0.135 | -0.312 | -0.855 |
| 1.148000000000004 | -0.134 | -0.31 | -0.853 |
| 1.152000000000004 | -0.133 | -0.309 | -0.851 |
| 1.156000000000004 | -0.131 | -0.307 | -0.849 |
| 1.160000000000004 | -0.13 | -0.305 | -0.846 |
| 1.164000000000004 | -0.129 | -0.304 | -0.844 |
| 1.168000000000004 | -0.128 | -0.302 | -0.842 |
| 1.172000000000004 | -0.127 | -0.3 | -0.84 |
| 1.176000000000004 | -0.125 | -0.299 | -0.838 |
| 1.180000000000004 | -0.124 | -0.297 | -0.835 |
| 1.184000000000004 | -0.123 | -0.296 | -0.833 |
| 1.188000000000004 | -0.122 | -0.294 | -0.831 |
| 1.192000000000004 | -0.121 | -0.292 | -0.828 |
| 1.196000000000004 | -0.12 | -0.291 | -0.826 |
| 1.200000000000004 | -0.118 | -0.289 | -0.824 |
| 1.204000000000004 | -0.117 | -0.287 | -0.821 |
| 1.208000000000004 | -0.116 | -0.286 | -0.819 |
| 1.212000000000004 | -0.115 | -0.284 | -0.817 |
| 1.216000000000004 | -0.114 | -0.282 | -0.814 |
| 1.220000000000004 | -0.113 | -0.281 | -0.812 |
| 1.224000000000004 | -0.112 | -0.279 | -0.809 |
| 1.228000000000004 | -0.111 | -0.278 | -0.807 |
| 1.232000000000004 | -0.11 | -0.276 | -0.804 |
| 1.236000000000004 | -0.109 | -0.274 | -0.802 |
| 1.240000000000004 | -0.107 | -0.273 | -0.799 |
| 1.244000000000004 | -0.106 | -0.271 | -0.797 |
| 1.248000000000004 | -0.105 | -0.269 | -0.794 |
| 1.252000000000004 | -0.104 | -0.268 | -0.792 |
| 1.256000000000004 | -0.103 | -0.266 | -0.789 |
| 1.260000000000004 | -0.102 | -0.264 | -0.787 |
| 1.264000000000004 | -0.101 | -0.263 | -0.784 |
| 1.268000000000004 | -0.1 | -0.261 | -0.781 |
| 1.272000000000004 | -0.099 | -0.26 | -0.779 |
| 1.276000000000004 | -0.098 | -0.258 | -0.776 |
| 1.280000000000004 | -0.097 | -0.256 | -0.773 |
| 1.284000000000004 | -0.096 | -0.255 | -0.771 |
| 1.288000000000004 | -0.095 | -0.253 | -0.768 |
| 1.292000000000004 | -0.094 | -0.251 | -0.765 |
| 1.296000000000004 | -0.093 | -0.25 | -0.763 |
| 1.300000000000004 | -0.092 | -0.248 | -0.76 |
| 1.304000000000004 | -0.091 | -0.247 | -0.757 |
| 1.308000000000004 | -0.09 | -0.245 | -0.754 |
| 1.312000000000004 | -0.089 | -0.243 | -0.752 |
| 1.316000000000004 | -0.088 | -0.242 | -0.749 |
| 1.320000000000004 | -0.088 | -0.24 | -0.746 |
| 1.324000000000004 | -0.087 | -0.238 | -0.743 |
| 1.328000000000004 | -0.086 | -0.237 | -0.74 |
| 1.332000000000004 | -0.085 | -0.235 | -0.738 |
| 1.336000000000004 | -0.084 | -0.234 | -0.735 |
| 1.340000000000004 | -0.083 | -0.232 | -0.732 |
| 1.344000000000004 | -0.082 | -0.23 | -0.729 |
| 1.348000000000004 | -0.081 | -0.229 | -0.726 |
| 1.352000000000004 | -0.08 | -0.227 | -0.723 |
| 1.356000000000004 | -0.08 | -0.226 | -0.72 |
| 1.360000000000004 | -0.079 | -0.224 | -0.717 |
| 1.364000000000004 | -0.078 | -0.223 | -0.714 |
| 1.368000000000004 | -0.077 | -0.221 | -0.711 |
| 1.372000000000004 | -0.076 | -0.219 | -0.708 |
| 1.376000000000004 | -0.075 | -0.218 | -0.706 |
| 1.380000000000004 | -0.074 | -0.216 | -0.703 |
| 1.384000000000004 | -0.074 | -0.215 | -0.7 |
| 1.388000000000005 | -0.073 | -0.213 | -0.697 |
| 1.392000000000004 | -0.072 | -0.212 | -0.694 |
| 1.396000000000004 | -0.071 | -0.21 | -0.691 |
| 1.400000000000005 | -0.07 | -0.208 | -0.688 |
| 1.404000000000005 | -0.07 | -0.207 | -0.684 |
| 1.408000000000005 | -0.069 | -0.205 | -0.681 |
| 1.412000000000005 | -0.068 | -0.204 | -0.678 |
| 1.416000000000005 | -0.067 | -0.202 | -0.675 |
| 1.420000000000005 | -0.067 | -0.201 | -0.672 |
| 1.424000000000005 | -0.066 | -0.199 | -0.669 |
| 1.428000000000005 | -0.065 | -0.198 | -0.666 |
| 1.432000000000005 | -0.064 | -0.196 | -0.663 |
| 1.436000000000005 | -0.064 | -0.195 | -0.66 |
| 1.440000000000005 | -0.063 | -0.193 | -0.657 |
| 1.444000000000005 | -0.062 | -0.192 | -0.654 |
| 1.448000000000005 | -0.061 | -0.19 | -0.651 |
| 1.452000000000005 | -0.061 | -0.189 | -0.647 |
| 1.456000000000005 | -0.06 | -0.187 | -0.644 |
| 1.460000000000005 | -0.059 | -0.186 | -0.641 |
| 1.464000000000005 | -0.059 | -0.184 | -0.638 |
| 1.468000000000005 | -0.058 | -0.183 | -0.635 |
| 1.472000000000005 | -0.057 | -0.181 | -0.632 |
| 1.476000000000005 | -0.057 | -0.18 | -0.628 |
| 1.480000000000005 | -0.056 | -0.178 | -0.625 |
| 1.484000000000005 | -0.055 | -0.177 | -0.622 |
| 1.488000000000005 | -0.055 | -0.176 | -0.619 |
| 1.492000000000005 | -0.054 | -0.174 | -0.616 |
| 1.496000000000005 | -0.053 | -0.173 | -0.613 |
| 1.500000000000005 | -0.053 | -0.171 | -0.609 |
| 1.504000000000005 | -0.052 | -0.17 | -0.606 |
| 1.508000000000005 | -0.051 | -0.168 | -0.603 |
| 1.512000000000005 | -0.051 | -0.167 | -0.6 |
| 1.516000000000005 | -0.05 | -0.166 | -0.597 |
| 1.520000000000005 | -0.05 | -0.164 | -0.593 |
| 1.524000000000005 | -0.049 | -0.163 | -0.59 |
| 1.528000000000005 | -0.048 | -0.161 | -0.587 |
| 1.532000000000005 | -0.048 | -0.16 | -0.584 |
| 1.536000000000005 | -0.047 | -0.159 | -0.58 |
| 1.540000000000005 | -0.047 | -0.157 | -0.577 |
| 1.544000000000005 | -0.046 | -0.156 | -0.574 |
| 1.548000000000005 | -0.046 | -0.155 | -0.571 |
| 1.552000000000005 | -0.045 | -0.153 | -0.567 |
| 1.556000000000005 | -0.044 | -0.152 | -0.564 |
| 1.560000000000005 | -0.044 | -0.151 | -0.561 |
| 1.564000000000005 | -0.043 | -0.149 | -0.558 |
| 1.568000000000005 | -0.043 | -0.148 | -0.554 |
| 1.572000000000005 | -0.042 | -0.147 | -0.551 |
| 1.576000000000005 | -0.042 | -0.145 | -0.548 |
| 1.580000000000005 | -0.041 | -0.144 | -0.545 |
| 1.584000000000005 | -0.041 | -0.143 | -0.541 |
| 1.588000000000005 | -0.04 | -0.141 | -0.538 |
| 1.592000000000005 | -0.04 | -0.14 | -0.535 |
| 1.596000000000005 | -0.039 | -0.139 | -0.532 |
| 1.600000000000005 | -0.039 | -0.138 | -0.529 |
| 1.604000000000005 | -0.038 | -0.136 | -0.525 |
| 1.608000000000005 | -0.038 | -0.135 | -0.522 |
| 1.612000000000005 | -0.037 | -0.134 | -0.519 |
| 1.616000000000005 | -0.037 | -0.133 | -0.516 |
| 1.620000000000005 | -0.036 | -0.131 | -0.512 |
| 1.624000000000005 | -0.036 | -0.13 | -0.509 |
| 1.628000000000005 | -0.035 | -0.129 | -0.506 |
| 1.632000000000005 | -0.035 | -0.128 | -0.503 |
| 1.636000000000005 | -0.034 | -0.126 | -0.499 |
| 1.640000000000005 | -0.034 | -0.125 | -0.496 |
| 1.644000000000005 | -0.034 | -0.124 | -0.493 |
| 1.648000000000005 | -0.033 | -0.123 | -0.49 |
| 1.652000000000005 | -0.033 | -0.122 | -0.487 |
| 1.656000000000005 | -0.032 | -0.121 | -0.483 |
| 1.660000000000005 | -0.032 | -0.119 | -0.48 |
| 1.664000000000005 | -0.031 | -0.118 | -0.477 |
| 1.668000000000005 | -0.031 | -0.117 | -0.474 |
| 1.672000000000005 | -0.031 | -0.116 | -0.471 |
| 1.676000000000005 | -0.03 | -0.115 | -0.467 |
| 1.680000000000005 | -0.03 | -0.114 | -0.464 |
| 1.684000000000005 | -0.029 | -0.113 | -0.461 |
| 1.688000000000005 | -0.029 | -0.111 | -0.458 |
| 1.692000000000005 | -0.029 | -0.11 | -0.455 |
| 1.696000000000005 | -0.028 | -0.109 | -0.451 |
| 1.700000000000005 | -0.028 | -0.108 | -0.448 |
| 1.704000000000005 | -0.027 | -0.107 | -0.445 |
| 1.708000000000005 | -0.027 | -0.106 | -0.442 |
| 1.712000000000005 | -0.027 | -0.105 | -0.439 |
| 1.716000000000005 | -0.026 | -0.104 | -0.436 |
| 1.720000000000005 | -0.026 | -0.103 | -0.433 |
| 1.724000000000005 | -0.026 | -0.102 | -0.429 |
| 1.728000000000005 | -0.025 | -0.101 | -0.426 |
| 1.732000000000005 | -0.025 | -0.1 | -0.423 |
| 1.736000000000005 | -0.025 | -0.099 | -0.42 |
| 1.740000000000005 | -0.024 | -0.098 | -0.417 |
| 1.744000000000005 | -0.024 | -0.097 | -0.414 |
| 1.748000000000005 | -0.024 | -0.096 | -0.411 |
| 1.752000000000005 | -0.023 | -0.095 | -0.408 |
| 1.756000000000005 | -0.023 | -0.094 | -0.405 |
| 1.760000000000005 | -0.023 | -0.093 | -0.402 |
| 1.764000000000005 | -0.022 | -0.092 | -0.399 |
| 1.768000000000005 | -0.022 | -0.091 | -0.396 |
| 1.772000000000005 | -0.022 | -0.09 | -0.393 |
| 1.776000000000005 | -0.021 | -0.089 | -0.39 |
| 1.780000000000005 | -0.021 | -0.088 | -0.387 |
| 1.784000000000005 | -0.021 | -0.087 | -0.384 |
| 1.788000000000005 | -0.02 | -0.086 | -0.381 |
| 1.792000000000005 | -0.02 | -0.085 | -0.378 |
| 1.796000000000005 | -0.02 | -0.084 | -0.375 |
| 1.800000000000005 | -0.02 | -0.083 | -0.372 |
| 1.804000000000005 | -0.019 | -0.082 | -0.369 |
| 1.808000000000005 | -0.019 | -0.081 | -0.366 |
| 1.812000000000005 | -0.019 | -0.08 | -0.363 |
| 1.816000000000005 | -0.018 | -0.079 | -0.36 |
| 1.820000000000005 | -0.018 | -0.079 | -0.357 |
| 1.824000000000005 | -0.018 | -0.078 | -0.354 |
| 1.828000000000005 | -0.018 | -0.077 | -0.351 |
| 1.832000000000005 | -0.017 | -0.076 | -0.348 |
| 1.836000000000005 | -0.017 | -0.075 | -0.345 |
| 1.840000000000005 | -0.017 | -0.074 | -0.343 |
| 1.844000000000005 | -0.017 | -0.073 | -0.34 |
| 1.848000000000005 | -0.016 | -0.073 | -0.337 |
| 1.852000000000005 | -0.016 | -0.072 | -0.334 |
| 1.856000000000005 | -0.016 | -0.071 | -0.331 |
| 1.860000000000005 | -0.016 | -0.07 | -0.328 |
| 1.864000000000005 | -0.015 | -0.069 | -0.326 |
| 1.868000000000005 | -0.015 | -0.069 | -0.323 |
| 1.872000000000005 | -0.015 | -0.068 | -0.32 |
| 1.876000000000005 | -0.015 | -0.067 | -0.317 |
| 1.880000000000005 | -0.015 | -0.066 | -0.315 |
| 1.884000000000005 | -0.014 | -0.065 | -0.312 |
| 1.888000000000005 | -0.014 | -0.065 | -0.309 |
| 1.892000000000005 | -0.014 | -0.064 | -0.306 |
| 1.896000000000005 | -0.014 | -0.063 | -0.304 |
| 1.900000000000005 | -0.014 | -0.062 | -0.301 |
| 1.904000000000005 | -0.013 | -0.062 | -0.298 |
| 1.908000000000005 | -0.013 | -0.061 | -0.296 |
| 1.912000000000005 | -0.013 | -0.06 | -0.293 |
| 1.916000000000005 | -0.013 | -0.059 | -0.29 |
| 1.920000000000005 | -0.013 | -0.059 | -0.288 |
| 1.924000000000005 | -0.012 | -0.058 | -0.285 |
| 1.928000000000005 | -0.012 | -0.057 | -0.283 |
| 1.932000000000005 | -0.012 | -0.057 | -0.28 |
| 1.936000000000005 | -0.012 | -0.056 | -0.277 |
| 1.940000000000005 | -0.012 | -0.055 | -0.275 |
| 1.944000000000005 | -0.011 | -0.055 | -0.272 |
| 1.948000000000005 | -0.011 | -0.054 | -0.27 |
| 1.952000000000005 | -0.011 | -0.053 | -0.267 |
| 1.956000000000005 | -0.011 | -0.053 | -0.265 |
| 1.960000000000005 | -0.011 | -0.052 | -0.262 |
| 1.964000000000005 | -0.011 | -0.051 | -0.26 |
| 1.968000000000005 | -0.01 | -0.051 | -0.257 |
| 1.972000000000005 | -0.01 | -0.05 | -0.255 |
| 1.976000000000005 | -0.01 | -0.049 | -0.252 |
| 1.980000000000005 | -0.01 | -0.049 | -0.25 |
| 1.984000000000005 | -0.01 | -0.048 | -0.248 |
| 1.988000000000005 | -0.01 | -0.048 | -0.245 |
| 1.992000000000005 | -0.009 | -0.047 | -0.243 |
| 1.996000000000005 | -0.009 | -0.046 | -0.24 |
| 2.000000000000005 | -0.009 | -0.046 | -0.238 |
| 2.004000000000005 | -0.009 | -0.045 | -0.236 |
| 2.008000000000005 | -0.009 | -0.045 | -0.233 |
| 2.012000000000005 | -0.009 | -0.044 | -0.231 |
| 2.016000000000005 | -0.009 | -0.043 | -0.229 |
| 2.020000000000005 | -0.008 | -0.043 | -0.227 |
| 2.024000000000005 | -0.008 | -0.042 | -0.224 |
| 2.028000000000005 | -0.008 | -0.042 | -0.222 |
| 2.032000000000005 | -0.008 | -0.041 | -0.22 |
| 2.036000000000005 | -0.008 | -0.041 | -0.218 |
| 2.040000000000005 | -0.008 | -0.04 | -0.215 |
| 2.044000000000005 | -0.008 | -0.04 | -0.213 |
| 2.048000000000005 | -0.008 | -0.039 | -0.211 |
| 2.052000000000005 | -0.007 | -0.039 | -0.209 |
| 2.056000000000005 | -0.007 | -0.038 | -0.207 |
| 2.060000000000005 | -0.007 | -0.038 | -0.205 |
| 2.064000000000005 | -0.007 | -0.037 | -0.202 |
| 2.068000000000005 | -0.007 | -0.037 | -0.2 |
| 2.072000000000005 | -0.007 | -0.036 | -0.198 |
| 2.076000000000005 | -0.007 | -0.036 | -0.196 |
| 2.080000000000005 | -0.007 | -0.035 | -0.194 |
| 2.084000000000005 | -0.006 | -0.035 | -0.192 |
| 2.088000000000005 | -0.006 | -0.034 | -0.19 |
| 2.092000000000005 | -0.006 | -0.034 | -0.188 |
| 2.096000000000005 | -0.006 | -0.033 | -0.186 |
| 2.100000000000005 | -0.006 | -0.033 | -0.184 |
| 2.104000000000005 | -0.006 | -0.032 | -0.182 |
| 2.108000000000005 | -0.006 | -0.032 | -0.18 |
| 2.112000000000005 | -0.006 | -0.032 | -0.178 |
| 2.116000000000005 | -0.006 | -0.031 | -0.176 |
| 2.120000000000005 | -0.006 | -0.031 | -0.174 |
| 2.124000000000005 | -0.005 | -0.03 | -0.172 |
| 2.128000000000005 | -0.005 | -0.03 | -0.17 |
| 2.132000000000005 | -0.005 | -0.029 | -0.169 |
| 2.136000000000005 | -0.005 | -0.029 | -0.167 |
| 2.140000000000005 | -0.005 | -0.029 | -0.165 |
| 2.144000000000005 | -0.005 | -0.028 | -0.163 |
| 2.148000000000005 | -0.005 | -0.028 | -0.161 |
| 2.152000000000005 | -0.005 | -0.027 | -0.159 |
| 2.156000000000005 | -0.005 | -0.027 | -0.158 |
| 2.160000000000005 | -0.005 | -0.027 | -0.156 |
| 2.164000000000005 | -0.005 | -0.026 | -0.154 |
| 2.168000000000005 | -0.005 | -0.026 | -0.152 |
| 2.172000000000005 | -0.004 | -0.026 | -0.151 |
| 2.176000000000005 | -0.004 | -0.025 | -0.149 |
| 2.180000000000005 | -0.004 | -0.025 | -0.147 |
| 2.184000000000005 | -0.004 | -0.024 | -0.145 |
| 2.188000000000005 | -0.004 | -0.024 | -0.144 |
| 2.192000000000005 | -0.004 | -0.024 | -0.142 |
| 2.196000000000005 | -0.004 | -0.023 | -0.14 |
| 2.200000000000005 | -0.004 | -0.023 | -0.139 |
| 2.204000000000005 | -0.004 | -0.023 | -0.137 |
| 2.208000000000005 | -0.004 | -0.022 | -0.136 |
| 2.212000000000005 | -0.004 | -0.022 | -0.134 |
| 2.216000000000005 | -0.004 | -0.022 | -0.132 |
| 2.220000000000005 | -0.004 | -0.021 | -0.131 |
| 2.224000000000005 | -0.004 | -0.021 | -0.129 |
| 2.228000000000005 | -0.003 | -0.021 | -0.128 |
| 2.232000000000005 | -0.003 | -0.021 | -0.126 |
| 2.236000000000005 | -0.003 | -0.02 | -0.125 |
| 2.240000000000005 | -0.003 | -0.02 | -0.123 |
| 2.244000000000005 | -0.003 | -0.02 | -0.122 |
| 2.248000000000005 | -0.003 | -0.019 | -0.12 |
| 2.252000000000005 | -0.003 | -0.019 | -0.119 |
| 2.256000000000005 | -0.003 | -0.019 | -0.117 |
| 2.260000000000005 | -0.003 | -0.018 | -0.116 |
| 2.264000000000005 | -0.003 | -0.018 | -0.114 |
| 2.268000000000005 | -0.003 | -0.018 | -0.113 |
| 2.272000000000005 | -0.003 | -0.018 | -0.112 |
| 2.276000000000005 | -0.003 | -0.017 | -0.11 |
| 2.280000000000005 | -0.003 | -0.017 | -0.109 |
| 2.284000000000005 | -0.003 | -0.017 | -0.108 |
| 2.288000000000005 | -0.003 | -0.017 | -0.106 |
| 2.292000000000005 | -0.003 | -0.016 | -0.105 |
| 2.296000000000005 | -0.003 | -0.016 | -0.104 |
| 2.300000000000005 | -0.003 | -0.016 | -0.102 |
| 2.304000000000005 | -0.002 | -0.016 | -0.101 |
| 2.308000000000005 | -0.002 | -0.015 | -0.1 |
| 2.312000000000005 | -0.002 | -0.015 | -0.098 |
| 2.316000000000005 | -0.002 | -0.015 | -0.097 |
| 2.320000000000005 | -0.002 | -0.015 | -0.096 |
| 2.324000000000005 | -0.002 | -0.014 | -0.095 |
| 2.328000000000005 | -0.002 | -0.014 | -0.093 |
| 2.332000000000005 | -0.002 | -0.014 | -0.092 |
| 2.336000000000005 | -0.002 | -0.014 | -0.091 |
| 2.340000000000005 | -0.002 | -0.014 | -0.09 |
| 2.344000000000005 | -0.002 | -0.013 | -0.089 |
| 2.348000000000005 | -0.002 | -0.013 | -0.088 |
| 2.352000000000005 | -0.002 | -0.013 | -0.086 |
| 2.356000000000005 | -0.002 | -0.013 | -0.085 |
| 2.360000000000005 | -0.002 | -0.013 | -0.084 |
| 2.364000000000005 | -0.002 | -0.012 | -0.083 |
| 2.368000000000005 | -0.002 | -0.012 | -0.082 |
| 2.372000000000005 | -0.002 | -0.012 | -0.081 |
| 2.376000000000005 | -0.002 | -0.012 | -0.08 |
| 2.380000000000005 | -0.002 | -0.012 | -0.079 |
| 2.384000000000005 | -0.002 | -0.011 | -0.078 |
| 2.388000000000005 | -0.002 | -0.011 | -0.077 |
| 2.392000000000005 | -0.002 | -0.011 | -0.076 |
| 2.396000000000005 | -0.002 | -0.011 | -0.075 |
| 2.400000000000005 | -0.002 | -0.011 | -0.074 |
| 2.404000000000005 | -0.002 | -0.01 | -0.073 |
| 2.408000000000005 | -0.002 | -0.01 | -0.072 |
| 2.412000000000005 | -0.001 | -0.01 | -0.071 |
| 2.416000000000005 | -0.001 | -0.01 | -0.07 |
| 2.420000000000005 | -0.001 | -0.01 | -0.069 |
| 2.424000000000005 | -0.001 | -0.01 | -0.068 |
| 2.428000000000005 | -0.001 | -0.009 | -0.067 |
| 2.432000000000005 | -0.001 | -0.009 | -0.066 |
| 2.436000000000005 | -0.001 | -0.009 | -0.065 |
| 2.440000000000005 | -0.001 | -0.009 | -0.064 |
| 2.444000000000005 | -0.001 | -0.009 | -0.063 |
| 2.448000000000005 | -0.001 | -0.009 | -0.062 |
| 2.452000000000005 | -0.001 | -0.009 | -0.061 |
| 2.456000000000005 | -0.001 | -0.008 | -0.061 |
| 2.460000000000005 | -0.001 | -0.008 | -0.06 |
| 2.464000000000005 | -0.001 | -0.008 | -0.059 |
| 2.468000000000005 | -0.001 | -0.008 | -0.058 |
| 2.472000000000005 | -0.001 | -0.008 | -0.057 |
| 2.476000000000005 | -0.001 | -0.008 | -0.056 |
| 2.480000000000005 | -0.001 | -0.008 | -0.056 |
| 2.484000000000005 | -0.001 | -0.007 | -0.055 |
| 2.488000000000005 | -0.001 | -0.007 | -0.054 |
| 2.492000000000005 | -0.001 | -0.007 | -0.053 |
| 2.496000000000005 | -0.001 | -0.007 | -0.052 |
| 2.500000000000005 | -0.001 | -0.007 | -0.052 |
| 2.504000000000005 | -0.001 | -0.007 | -0.051 |
| 2.508000000000005 | -0.001 | -0.007 | -0.05 |
| 2.512000000000005 | -0.001 | -0.007 | -0.049 |
| 2.516000000000005 | -0.001 | -0.007 | -0.049 |
| 2.520000000000005 | -0.001 | -0.006 | -0.048 |
| 2.524000000000005 | -0.001 | -0.006 | -0.047 |
| 2.528000000000005 | -0.001 | -0.006 | -0.047 |
| 2.532000000000005 | -0.001 | -0.006 | -0.046 |
| 2.536000000000005 | -0.001 | -0.006 | -0.045 |
| 2.540000000000005 | -0.001 | -0.006 | -0.045 |
| 2.544000000000005 | -0.001 | -0.006 | -0.044 |
| 2.548000000000005 | -0.001 | -0.006 | -0.043 |
| 2.552000000000005 | -0.001 | -0.006 | -0.043 |
| 2.556000000000005 | -0.001 | -0.005 | -0.042 |
| 2.560000000000005 | -0.001 | -0.005 | -0.041 |
| 2.564000000000005 | -0.001 | -0.005 | -0.041 |
| 2.568000000000005 | -0.001 | -0.005 | -0.04 |
| 2.572000000000005 | -0.001 | -0.005 | -0.04 |
| 2.576000000000005 | -0.001 | -0.005 | -0.039 |
| 2.580000000000005 | -0.001 | -0.005 | -0.038 |
| 2.584000000000005 | -0.001 | -0.005 | -0.038 |
| 2.588000000000005 | -0.001 | -0.005 | -0.037 |
| 2.592000000000005 | -0.001 | -0.005 | -0.037 |
| 2.596000000000005 | -0.001 | -0.005 | -0.036 |
| 2.600000000000005 | -0.001 | -0.004 | -0.035 |
| 2.604000000000005 | -0.001 | -0.004 | -0.035 |
| 2.608000000000005 | -0.001 | -0.004 | -0.034 |
| 2.612000000000005 | -0.001 | -0.004 | -0.034 |
| 2.616000000000005 | -0.001 | -0.004 | -0.033 |
| 2.620000000000005 | -0.001 | -0.004 | -0.033 |
| 2.624000000000005 | -0.001 | -0.004 | -0.032 |
| 2.628000000000005 | -0.001 | -0.004 | -0.032 |
| 2.632000000000005 | 0 | -0.004 | -0.031 |
| 2.636000000000005 | 0 | -0.004 | -0.031 |
| 2.640000000000005 | 0 | -0.004 | -0.03 |
| 2.644000000000005 | 0 | -0.004 | -0.03 |
| 2.648000000000005 | 0 | -0.004 | -0.029 |
| 2.652000000000005 | 0 | -0.004 | -0.029 |
| 2.656000000000005 | 0 | -0.003 | -0.028 |
| 2.660000000000005 | 0 | -0.003 | -0.028 |
| 2.664000000000005 | 0 | -0.003 | -0.028 |
| 2.668000000000005 | 0 | -0.003 | -0.027 |
| 2.672000000000005 | 0 | -0.003 | -0.027 |
| 2.676000000000005 | 0 | -0.003 | -0.026 |
| 2.680000000000005 | 0 | -0.003 | -0.026 |
| 2.684000000000005 | 0 | -0.003 | -0.025 |
| 2.688000000000005 | 0 | -0.003 | -0.025 |
| 2.692000000000005 | 0 | -0.003 | -0.025 |
| 2.696000000000005 | 0 | -0.003 | -0.024 |
| 2.700000000000005 | 0 | -0.003 | -0.024 |
| 2.704000000000005 | 0 | -0.003 | -0.023 |
| 2.708000000000005 | 0 | -0.003 | -0.023 |
| 2.712000000000005 | 0 | -0.003 | -0.023 |
| 2.716000000000005 | 0 | -0.003 | -0.022 |
| 2.720000000000005 | 0 | -0.003 | -0.022 |
| 2.724000000000005 | 0 | -0.003 | -0.022 |
| 2.728000000000005 | 0 | -0.002 | -0.021 |
| 2.732000000000005 | 0 | -0.002 | -0.021 |
| 2.736000000000005 | 0 | -0.002 | -0.02 |
| 2.740000000000005 | 0 | -0.002 | -0.02 |
| 2.744000000000005 | 0 | -0.002 | -0.02 |
| 2.748000000000005 | 0 | -0.002 | -0.019 |
| 2.752000000000005 | 0 | -0.002 | -0.019 |
| 2.756000000000005 | 0 | -0.002 | -0.019 |
| 2.760000000000005 | 0 | -0.002 | -0.019 |
| 2.764000000000005 | 0 | -0.002 | -0.018 |
| 2.768000000000005 | 0 | -0.002 | -0.018 |
| 2.772000000000005 | 0 | -0.002 | -0.018 |
| 2.776000000000005 | 0 | -0.002 | -0.017 |
| 2.780000000000005 | 0 | -0.002 | -0.017 |
| 2.784000000000005 | 0 | -0.002 | -0.017 |
| 2.788000000000006 | 0 | -0.002 | -0.016 |
| 2.792000000000005 | 0 | -0.002 | -0.016 |
| 2.796000000000005 | 0 | -0.002 | -0.016 |
| 2.800000000000006 | 0 | -0.002 | -0.016 |
| 2.804000000000006 | 0 | -0.002 | -0.015 |
| 2.808000000000006 | 0 | -0.002 | -0.015 |
| 2.812000000000006 | 0 | -0.002 | -0.015 |
| 2.816000000000006 | 0 | -0.002 | -0.015 |
| 2.820000000000006 | 0 | -0.002 | -0.014 |
| 2.824000000000006 | 0 | -0.002 | -0.014 |
| 2.828000000000006 | 0 | -0.002 | -0.014 |
| 2.832000000000006 | 0 | -0.001 | -0.014 |
| 2.836000000000006 | 0 | -0.001 | -0.013 |
| 2.840000000000006 | 0 | -0.001 | -0.013 |
| 2.844000000000006 | 0 | -0.001 | -0.013 |
| 2.848000000000006 | 0 | -0.001 | -0.013 |
| 2.852000000000006 | 0 | -0.001 | -0.012 |
| 2.856000000000006 | 0 | -0.001 | -0.012 |
| 2.860000000000006 | 0 | -0.001 | -0.012 |
| 2.864000000000006 | 0 | -0.001 | -0.012 |
| 2.868000000000006 | 0 | -0.001 | -0.012 |
| 2.872000000000006 | 0 | -0.001 | -0.011 |
| 2.876000000000006 | 0 | -0.001 | -0.011 |
| 2.880000000000006 | 0 | -0.001 | -0.011 |
| 2.884000000000006 | 0 | -0.001 | -0.011 |
| 2.888000000000006 | 0 | -0.001 | -0.011 |
| 2.892000000000006 | 0 | -0.001 | -0.01 |
| 2.896000000000006 | 0 | -0.001 | -0.01 |
| 2.900000000000006 | 0 | -0.001 | -0.01 |
| 2.904000000000006 | 0 | -0.001 | -0.01 |
| 2.908000000000006 | 0 | -0.001 | -0.01 |
| 2.912000000000006 | 0 | -0.001 | -0.009 |
| 2.916000000000006 | 0 | -0.001 | -0.009 |
| 2.920000000000006 | 0 | -0.001 | -0.009 |
| 2.924000000000006 | 0 | -0.001 | -0.009 |
| 2.928000000000006 | 0 | -0.001 | -0.009 |
| 2.932000000000006 | 0 | -0.001 | -0.009 |
| 2.936000000000006 | 0 | -0.001 | -0.008 |
| 2.940000000000006 | 0 | -0.001 | -0.008 |
| 2.944000000000006 | 0 | -0.001 | -0.008 |
| 2.948000000000006 | 0 | -0.001 | -0.008 |
| 2.952000000000006 | 0 | -0.001 | -0.008 |
| 2.956000000000006 | 0 | -0.001 | -0.008 |
| 2.960000000000006 | 0 | -0.001 | -0.008 |
| 2.964000000000006 | 0 | -0.001 | -0.007 |
| 2.968000000000006 | 0 | -0.001 | -0.007 |
| 2.972000000000006 | 0 | -0.001 | -0.007 |
| 2.976000000000006 | 0 | -0.001 | -0.007 |
| 2.980000000000006 | 0 | -0.001 | -0.007 |
| 2.984000000000006 | 0 | -0.001 | -0.007 |
| 2.988000000000006 | 0 | -0.001 | -0.007 |
| 2.992000000000006 | 0 | -0.001 | -0.006 |
| 2.996000000000006 | 0 | -0.001 | -0.006 |
| 3.000000000000006 | 0 | -0.001 | -0.006 |
| 3.004000000000006 | 0 | -0.001 | -0.006 |
| 3.008000000000006 | 0 | -0.001 | -0.006 |
| 3.012000000000006 | 0 | -0.001 | -0.006 |
| 3.016000000000006 | 0 | -0.001 | -0.006 |
| 3.020000000000006 | 0 | -0.001 | -0.006 |
| 3.024000000000006 | 0 | -0.001 | -0.006 |
| 3.028000000000006 | 0 | -0.001 | -0.005 |
| 3.032000000000006 | 0 | -0.001 | -0.005 |
| 3.036000000000006 | 0 | -0.001 | -0.005 |
| 3.040000000000006 | 0 | 0 | -0.005 |
| 3.044000000000006 | 0 | 0 | -0.005 |
| 3.048000000000006 | 0 | 0 | -0.005 |
| 3.052000000000006 | 0 | 0 | -0.005 |
| 3.056000000000006 | 0 | 0 | -0.005 |
| 3.060000000000006 | 0 | 0 | -0.005 |
| 3.064000000000006 | 0 | 0 | -0.005 |
| 3.068000000000006 | 0 | 0 | -0.004 |
| 3.072000000000006 | 0 | 0 | -0.004 |
| 3.076000000000006 | 0 | 0 | -0.004 |
| 3.080000000000006 | 0 | 0 | -0.004 |
| 3.084000000000006 | 0 | 0 | -0.004 |
| 3.088000000000006 | 0 | 0 | -0.004 |
| 3.092000000000006 | 0 | 0 | -0.004 |
| 3.096000000000006 | 0 | 0 | -0.004 |
| 3.100000000000006 | 0 | 0 | -0.004 |
| 3.104000000000006 | 0 | 0 | -0.004 |
| 3.108000000000006 | 0 | 0 | -0.004 |
| 3.112000000000006 | 0 | 0 | -0.004 |
| 3.116000000000006 | 0 | 0 | -0.004 |
| 3.120000000000006 | 0 | 0 | -0.003 |
| 3.124000000000006 | 0 | 0 | -0.003 |
| 3.128000000000006 | 0 | 0 | -0.003 |
| 3.132000000000006 | 0 | 0 | -0.003 |
| 3.136000000000006 | 0 | 0 | -0.003 |
| 3.140000000000006 | 0 | 0 | -0.003 |
| 3.144000000000006 | 0 | 0 | -0.003 |
| 3.148000000000006 | 0 | 0 | -0.003 |
| 3.152000000000006 | 0 | 0 | -0.003 |
| 3.156000000000006 | 0 | 0 | -0.003 |
| 3.160000000000006 | 0 | 0 | -0.003 |
| 3.164000000000006 | 0 | 0 | -0.003 |
| 3.168000000000006 | 0 | 0 | -0.003 |
| 3.172000000000006 | 0 | 0 | -0.003 |
| 3.176000000000006 | 0 | 0 | -0.003 |
| 3.180000000000006 | 0 | 0 | -0.003 |
| 3.184000000000006 | 0 | 0 | -0.002 |
| 3.188000000000006 | 0 | 0 | -0.002 |
| 3.192000000000006 | 0 | 0 | -0.002 |
| 3.196000000000006 | 0 | 0 | -0.002 |
| 3.200000000000006 | 0 | 0 | -0.002 |
| 3.204000000000006 | 0 | 0 | -0.002 |
| 3.208000000000006 | 0 | 0 | -0.002 |
| 3.212000000000006 | 0 | 0 | -0.002 |
| 3.216000000000006 | 0 | 0 | -0.002 |
| 3.220000000000006 | 0 | 0 | -0.002 |
| 3.224000000000006 | 0 | 0 | -0.002 |
| 3.228000000000006 | 0 | 0 | -0.002 |
| 3.232000000000006 | 0 | 0 | -0.002 |
| 3.236000000000006 | 0 | 0 | -0.002 |
| 3.240000000000006 | 0 | 0 | -0.002 |
| 3.244000000000006 | 0 | 0 | -0.002 |
| 3.248000000000006 | 0 | 0 | -0.002 |
| 3.252000000000006 | 0 | 0 | -0.002 |
| 3.256000000000006 | 0 | 0 | -0.002 |
| 3.260000000000006 | 0 | 0 | -0.002 |
| 3.264000000000006 | 0 | 0 | -0.002 |
| 3.268000000000006 | 0 | 0 | -0.002 |
| 3.272000000000006 | 0 | 0 | -0.002 |
| 3.276000000000006 | 0 | 0 | -0.002 |
| 3.280000000000006 | 0 | 0 | -0.001 |
| 3.284000000000006 | 0 | 0 | -0.001 |
| 3.288000000000006 | 0 | 0 | -0.001 |
| 3.292000000000006 | 0 | 0 | -0.001 |
| 3.296000000000006 | 0 | 0 | -0.001 |
| 3.300000000000006 | 0 | 0 | -0.001 |
| 3.304000000000006 | 0 | 0 | -0.001 |
| 3.308000000000006 | 0 | 0 | -0.001 |
| 3.312000000000006 | 0 | 0 | -0.001 |
| 3.316000000000006 | 0 | 0 | -0.001 |
| 3.320000000000006 | 0 | 0 | -0.001 |
| 3.324000000000006 | 0 | 0 | -0.001 |
| 3.328000000000006 | 0 | 0 | -0.001 |
| 3.332000000000006 | 0 | 0 | -0.001 |
| 3.336000000000006 | 0 | 0 | -0.001 |
| 3.340000000000006 | 0 | 0 | -0.001 |
| 3.344000000000006 | 0 | 0 | -0.001 |
| 3.348000000000006 | 0 | 0 | -0.001 |
| 3.352000000000006 | 0 | 0 | -0.001 |
| 3.356000000000006 | 0 | 0 | -0.001 |
| 3.360000000000006 | 0 | 0 | -0.001 |
| 3.364000000000006 | 0 | 0 | -0.001 |
| 3.368000000000006 | 0 | 0 | -0.001 |
| 3.372000000000006 | 0 | 0 | -0.001 |
| 3.376000000000006 | 0 | 0 | -0.001 |
| 3.380000000000006 | 0 | 0 | -0.001 |
| 3.384000000000006 | 0 | 0 | -0.001 |
| 3.388000000000006 | 0 | 0 | -0.001 |
| 3.392000000000006 | 0 | 0 | -0.001 |
| 3.396000000000006 | 0 | 0 | -0.001 |
| 3.400000000000006 | 0 | 0 | -0.001 |
| 3.404000000000006 | 0 | 0 | -0.001 |
| 3.408000000000006 | 0 | 0 | -0.001 |
| 3.412000000000006 | 0 | 0 | -0.001 |
| 3.416000000000006 | 0 | 0 | -0.001 |
| 3.420000000000006 | 0 | 0 | -0.001 |
| 3.424000000000006 | 0 | 0 | -0.001 |
| 3.428000000000006 | 0 | 0 | -0.001 |
| 3.432000000000006 | 0 | 0 | -0.001 |
| 3.436000000000006 | 0 | 0 | -0.001 |
| 3.440000000000006 | 0 | 0 | -0.001 |
| 3.444000000000006 | 0 | 0 | -0.001 |
| 3.448000000000006 | 0 | 0 | -0.001 |
| 3.452000000000006 | 0 | 0 | -0.001 |
| 3.456000000000006 | 0 | 0 | -0.001 |
| 3.460000000000006 | 0 | 0 | -0.001 |
| 3.464000000000006 | 0 | 0 | -0.001 |
| 3.468000000000006 | 0 | 0 | -0.001 |
| 3.472000000000006 | 0 | 0 | 0 |
| 3.476000000000006 | 0 | 0 | 0 |
| 3.480000000000006 | 0 | 0 | 0 |
| 3.484000000000006 | 0 | 0 | 0 |
| 3.488000000000006 | 0 | 0 | 0 |
| 3.492000000000006 | 0 | 0 | 0 |
| 3.496000000000006 | 0 | 0 | 0 |
| 3.500000000000006 | 0 | 0 | 0 |
| 3.504000000000006 | 0 | 0 | 0 |
| 3.508000000000006 | 0 | 0 | 0 |
| 3.512000000000006 | 0 | 0 | 0 |
| 3.516000000000006 | 0 | 0 | 0 |
| 3.520000000000006 | 0 | 0 | 0 |
| 3.524000000000006 | 0 | 0 | 0 |
| 3.528000000000006 | 0 | 0 | 0 |
| 3.532000000000006 | 0 | 0 | 0 |
| 3.536000000000006 | 0 | 0 | 0 |
| 3.540000000000006 | 0 | 0 | 0 |
| 3.544000000000006 | 0 | 0 | 0 |
| 3.548000000000006 | 0 | 0 | 0 |
| 3.552000000000006 | 0 | 0 | 0 |
| 3.556000000000006 | 0 | 0 | 0 |
| 3.560000000000006 | 0 | 0 | 0 |
| 3.564000000000006 | 0 | 0 | 0 |
| 3.568000000000006 | 0 | 0 | 0 |
| 3.572000000000006 | 0 | 0 | 0 |
| 3.576000000000006 | 0 | 0 | 0 |
| 3.580000000000006 | 0 | 0 | 0 |
| 3.584000000000006 | 0 | 0 | 0 |
| 3.588000000000006 | 0 | 0 | 0 |
| 3.592000000000006 | 0 | 0 | 0 |
| 3.596000000000006 | 0 | 0 | 0 |
| 3.600000000000006 | 0 | 0 | 0 |
| 3.604000000000006 | 0 | 0 | 0 |
| 3.608000000000006 | 0 | 0 | 0 |
| 3.612000000000006 | 0 | 0 | 0 |
| 3.616000000000006 | 0 | 0 | 0 |
| 3.620000000000006 | 0 | 0 | 0 |
| 3.624000000000006 | 0 | 0 | 0 |
| 3.628000000000006 | 0 | 0 | 0 |
| 3.632000000000006 | 0 | 0 | 0 |
| 3.636000000000006 | 0 | 0 | 0 |
| 3.640000000000006 | 0 | 0 | 0 |
| 3.644000000000006 | 0 | 0 | 0 |
| 3.648000000000006 | 0 | 0 | 0 |
| 3.652000000000006 | 0 | 0 | 0 |
| 3.656000000000006 | 0 | 0 | 0 |
| 3.660000000000006 | 0 | 0 | 0 |
| 3.664000000000006 | 0 | 0 | 0 |
| 3.668000000000006 | 0 | 0 | 0 |
| 3.672000000000006 | 0 | 0 | 0 |
| 3.676000000000006 | 0 | 0 | 0 |
| 3.680000000000006 | 0 | 0 | 0 |
| 3.684000000000006 | 0 | 0 | 0 |
| 3.688000000000006 | 0 | 0 | 0 |
| 3.692000000000006 | 0 | 0 | 0 |
| 3.696000000000006 | 0 | 0 | 0 |
| 3.700000000000006 | 0 | 0 | 0 |
| 3.704000000000006 | 0 | 0 | 0 |
| 3.708000000000006 | 0 | 0 | 0 |
| 3.712000000000006 | 0 | 0 | 0 |
| 3.716000000000006 | 0 | 0 | 0 |
| 3.720000000000006 | 0 | 0 | 0 |
| 3.724000000000006 | 0 | 0 | 0 |
| 3.728000000000006 | 0 | 0 | 0 |
| 3.732000000000006 | 0 | 0 | 0 |
| 3.736000000000006 | 0 | 0 | 0 |
| 3.740000000000006 | 0 | 0 | 0 |
| 3.744000000000006 | 0 | 0 | 0 |
| 3.748000000000006 | 0 | 0 | 0 |
| 3.752000000000006 | 0 | 0 | 0 |
| 3.756000000000006 | 0 | 0 | 0 |
| 3.760000000000006 | 0 | 0 | 0 |
| 3.764000000000006 | 0 | 0 | 0 |
| 3.768000000000006 | 0 | 0 | 0 |
| 3.772000000000006 | 0 | 0 | 0 |
| 3.776000000000006 | 0 | 0 | 0 |
| 3.780000000000006 | 0 | 0 | 0 |
| 3.784000000000006 | 0 | 0 | 0 |
| 3.788000000000006 | 0 | 0 | 0 |
| 3.792000000000006 | 0 | 0 | 0 |
| 3.796000000000006 | 0 | 0 | 0 |
| 3.800000000000006 | 0 | 0 | 0 |
| 3.804000000000006 | 0 | 0 | 0 |
| 3.808000000000006 | 0 | 0 | 0 |
| 3.812000000000006 | 0 | 0 | 0 |
| 3.816000000000006 | 0 | 0 | 0 |
| 3.820000000000006 | 0 | 0 | 0 |
| 3.824000000000006 | 0 | 0 | 0 |
| 3.828000000000006 | 0 | 0 | 0 |
| 3.832000000000006 | 0 | 0 | 0 |
| 3.836000000000006 | 0 | 0 | 0 |
| 3.840000000000006 | 0 | 0 | 0 |
| 3.844000000000006 | 0 | 0 | 0 |
| 3.848000000000006 | 0 | 0 | 0 |
| 3.852000000000006 | 0 | 0 | 0 |
| 3.856000000000006 | 0 | 0 | 0 |
| 3.860000000000006 | 0 | 0 | 0 |
| 3.864000000000006 | 0 | 0 | 0 |
| 3.868000000000006 | 0 | 0 | 0 |
| 3.872000000000006 | 0 | 0 | 0 |
| 3.876000000000006 | 0 | 0 | 0 |
| 3.880000000000006 | 0 | 0 | 0 |
| 3.884000000000006 | 0 | 0 | 0 |
| 3.888000000000007 | 0 | 0 | 0 |
| 3.892000000000006 | 0 | 0 | 0 |
| 3.896000000000006 | 0 | 0 | 0 |
| 3.900000000000007 | 0 | 0 | 0 |
| 3.904000000000007 | 0 | 0 | 0 |
| 3.908000000000007 | 0 | 0 | 0 |
| 3.912000000000007 | 0 | 0 | 0 |
| 3.916000000000007 | 0 | 0 | 0 |
| 3.920000000000007 | 0 | 0 | 0 |
| 3.924000000000007 | 0 | 0 | 0 |
| 3.928000000000007 | 0 | 0 | 0 |
| 3.932000000000007 | 0 | 0 | 0 |
| 3.936000000000007 | 0 | 0 | 0 |
| 3.940000000000007 | 0 | 0 | 0 |
| 3.944000000000007 | 0 | 0 | 0 |
| 3.948000000000007 | 0 | 0 | 0 |
| 3.952000000000007 | 0 | 0 | 0 |
| 3.956000000000007 | 0 | 0 | 0 |
| 3.960000000000007 | 0 | 0 | 0 |
| 3.964000000000007 | 0 | 0 | 0 |
| 3.968000000000007 | 0 | 0 | 0 |
| 3.972000000000007 | 0 | 0 | 0 |
| 3.976000000000007 | 0 | 0 | 0 |
| 3.980000000000007 | 0 | 0 | 0 |
| 3.984000000000007 | 0 | 0 | 0 |
| 3.988000000000007 | 0 | 0 | 0 |
| 3.992000000000007 | 0 | 0 | 0 |
| 3.996000000000007 | 0 | 0 | 0 |
| 4.000000000000006 | 0 | 0 | 0 |